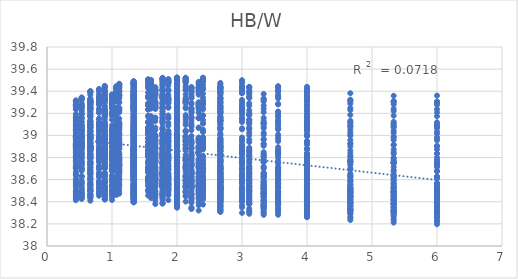
| Category | out:UTCI |
|---|---|
| 1.3333333333333333 | 38.668 |
| 0.8888888888888888 | 38.741 |
| 0.6666666666666666 | 38.758 |
| 0.5333333333333333 | 38.744 |
| 0.4444444444444444 | 38.714 |
| 1.3333333333333333 | 38.517 |
| 0.8888888888888888 | 38.595 |
| 0.6666666666666666 | 38.642 |
| 0.5333333333333333 | 38.679 |
| 0.4444444444444444 | 38.672 |
| 1.3333333333333333 | 38.457 |
| 0.8888888888888888 | 38.521 |
| 0.6666666666666666 | 38.559 |
| 0.5333333333333333 | 38.588 |
| 0.4444444444444444 | 38.606 |
| 1.3333333333333333 | 38.426 |
| 0.8888888888888888 | 38.489 |
| 0.6666666666666666 | 38.495 |
| 0.5333333333333333 | 38.526 |
| 0.4444444444444444 | 38.543 |
| 1.3333333333333333 | 38.423 |
| 0.8888888888888888 | 38.454 |
| 0.6666666666666666 | 38.47 |
| 0.5333333333333333 | 38.474 |
| 0.4444444444444444 | 38.492 |
| 1.3333333333333333 | 38.417 |
| 0.8888888888888888 | 38.42 |
| 0.6666666666666666 | 38.46 |
| 0.5333333333333333 | 38.458 |
| 0.4444444444444444 | 38.452 |
| 1.3333333333333333 | 38.414 |
| 0.8888888888888888 | 38.429 |
| 0.6666666666666666 | 38.432 |
| 0.5333333333333333 | 38.448 |
| 0.4444444444444444 | 38.426 |
| 1.3333333333333333 | 38.403 |
| 0.8888888888888888 | 38.423 |
| 0.6666666666666666 | 38.41 |
| 0.5333333333333333 | 38.426 |
| 0.4444444444444444 | 38.414 |
| 2.0 | 38.693 |
| 1.3333333333333333 | 38.779 |
| 1.0 | 38.826 |
| 0.8 | 38.826 |
| 0.6666666666666666 | 38.8 |
| 2.0 | 38.522 |
| 1.3333333333333333 | 38.629 |
| 1.0 | 38.708 |
| 0.8 | 38.76 |
| 0.6666666666666666 | 38.75 |
| 2.0 | 38.432 |
| 1.3333333333333333 | 38.535 |
| 1.0 | 38.614 |
| 0.8 | 38.657 |
| 0.6666666666666666 | 38.685 |
| 2.0 | 38.386 |
| 1.3333333333333333 | 38.482 |
| 1.0 | 38.531 |
| 0.8 | 38.588 |
| 0.6666666666666666 | 38.615 |
| 2.0 | 38.378 |
| 1.3333333333333333 | 38.439 |
| 1.0 | 38.492 |
| 0.8 | 38.522 |
| 0.6666666666666666 | 38.553 |
| 2.0 | 38.37 |
| 1.3333333333333333 | 38.397 |
| 1.0 | 38.476 |
| 0.8 | 38.494 |
| 0.6666666666666666 | 38.504 |
| 2.0 | 38.364 |
| 1.3333333333333333 | 38.402 |
| 1.0 | 38.442 |
| 0.8 | 38.48 |
| 0.6666666666666666 | 38.47 |
| 2.0 | 38.352 |
| 1.3333333333333333 | 38.397 |
| 1.0 | 38.416 |
| 0.8 | 38.455 |
| 0.6666666666666666 | 38.456 |
| 2.6666666666666665 | 38.703 |
| 1.7777777777777777 | 38.82 |
| 1.3333333333333333 | 38.854 |
| 1.0666666666666667 | 38.875 |
| 0.8888888888888888 | 38.856 |
| 2.6666666666666665 | 38.522 |
| 1.7777777777777777 | 38.662 |
| 1.3333333333333333 | 38.729 |
| 1.0666666666666667 | 38.799 |
| 0.8888888888888888 | 38.802 |
| 2.6666666666666665 | 38.418 |
| 1.7777777777777777 | 38.557 |
| 1.3333333333333333 | 38.63 |
| 1.0666666666666667 | 38.697 |
| 0.8888888888888888 | 38.734 |
| 2.6666666666666665 | 38.355 |
| 1.7777777777777777 | 38.493 |
| 1.3333333333333333 | 38.54 |
| 1.0666666666666667 | 38.623 |
| 0.8888888888888888 | 38.661 |
| 2.6666666666666665 | 38.34 |
| 1.7777777777777777 | 38.436 |
| 1.3333333333333333 | 38.489 |
| 1.0666666666666667 | 38.549 |
| 0.8888888888888888 | 38.593 |
| 2.6666666666666665 | 38.33 |
| 1.7777777777777777 | 38.388 |
| 1.3333333333333333 | 38.463 |
| 1.0666666666666667 | 38.512 |
| 0.8888888888888888 | 38.534 |
| 2.6666666666666665 | 38.324 |
| 1.7777777777777777 | 38.389 |
| 1.3333333333333333 | 38.424 |
| 1.0666666666666667 | 38.49 |
| 0.8888888888888888 | 38.494 |
| 2.6666666666666665 | 38.31 |
| 1.7777777777777777 | 38.383 |
| 1.3333333333333333 | 38.394 |
| 1.0666666666666667 | 38.462 |
| 0.8888888888888888 | 38.472 |
| 3.3333333333333335 | 38.712 |
| 2.2222222222222223 | 38.824 |
| 1.6666666666666667 | 38.878 |
| 1.3333333333333333 | 38.886 |
| 1.1111111111111112 | 38.88 |
| 3.3333333333333335 | 38.524 |
| 2.2222222222222223 | 38.658 |
| 1.6666666666666667 | 38.749 |
| 1.3333333333333333 | 38.808 |
| 1.1111111111111112 | 38.826 |
| 3.3333333333333335 | 38.414 |
| 2.2222222222222223 | 38.547 |
| 1.6666666666666667 | 38.644 |
| 1.3333333333333333 | 38.704 |
| 1.1111111111111112 | 38.756 |
| 3.3333333333333335 | 38.343 |
| 2.2222222222222223 | 38.474 |
| 1.6666666666666667 | 38.547 |
| 1.3333333333333333 | 38.622 |
| 1.1111111111111112 | 38.68 |
| 3.3333333333333335 | 38.319 |
| 2.2222222222222223 | 38.407 |
| 1.6666666666666667 | 38.491 |
| 1.3333333333333333 | 38.544 |
| 1.1111111111111112 | 38.609 |
| 3.3333333333333335 | 38.305 |
| 2.2222222222222223 | 38.348 |
| 1.6666666666666667 | 38.458 |
| 1.3333333333333333 | 38.501 |
| 1.1111111111111112 | 38.547 |
| 3.3333333333333335 | 38.297 |
| 2.2222222222222223 | 38.344 |
| 1.6666666666666667 | 38.413 |
| 1.3333333333333333 | 38.473 |
| 1.1111111111111112 | 38.499 |
| 3.3333333333333335 | 38.282 |
| 2.2222222222222223 | 38.334 |
| 1.6666666666666667 | 38.38 |
| 1.3333333333333333 | 38.439 |
| 1.1111111111111112 | 38.473 |
| 4.0 | 38.71 |
| 2.6666666666666665 | 38.832 |
| 2.0 | 38.879 |
| 1.6 | 38.908 |
| 1.3333333333333333 | 38.891 |
| 4.0 | 38.52 |
| 2.6666666666666665 | 38.661 |
| 2.0 | 38.745 |
| 1.6 | 38.826 |
| 1.3333333333333333 | 38.833 |
| 4.0 | 38.406 |
| 2.6666666666666665 | 38.545 |
| 2.0 | 38.636 |
| 1.6 | 38.719 |
| 1.3333333333333333 | 38.76 |
| 4.0 | 38.332 |
| 2.6666666666666665 | 38.468 |
| 2.0 | 38.534 |
| 1.6 | 38.634 |
| 1.3333333333333333 | 38.681 |
| 4.0 | 38.305 |
| 2.6666666666666665 | 38.398 |
| 2.0 | 38.477 |
| 1.6 | 38.554 |
| 1.3333333333333333 | 38.609 |
| 4.0 | 38.285 |
| 2.6666666666666665 | 38.335 |
| 2.0 | 38.439 |
| 1.6 | 38.509 |
| 1.3333333333333333 | 38.543 |
| 4.0 | 38.275 |
| 2.6666666666666665 | 38.327 |
| 2.0 | 38.388 |
| 1.6 | 38.475 |
| 1.3333333333333333 | 38.493 |
| 4.0 | 38.26 |
| 2.6666666666666665 | 38.313 |
| 2.0 | 38.346 |
| 1.6 | 38.434 |
| 1.3333333333333333 | 38.462 |
| 4.666666666666667 | 38.703 |
| 3.111111111111111 | 38.833 |
| 2.3333333333333335 | 38.884 |
| 1.8666666666666667 | 38.91 |
| 1.5555555555555556 | 38.909 |
| 4.666666666666667 | 38.51 |
| 3.111111111111111 | 38.661 |
| 2.3333333333333335 | 38.746 |
| 1.8666666666666667 | 38.824 |
| 1.5555555555555556 | 38.847 |
| 4.666666666666667 | 38.396 |
| 3.111111111111111 | 38.542 |
| 2.3333333333333335 | 38.633 |
| 1.8666666666666667 | 38.716 |
| 1.5555555555555556 | 38.771 |
| 4.666666666666667 | 38.319 |
| 3.111111111111111 | 38.461 |
| 2.3333333333333335 | 38.527 |
| 1.8666666666666667 | 38.627 |
| 1.5555555555555556 | 38.69 |
| 4.666666666666667 | 38.291 |
| 3.111111111111111 | 38.389 |
| 2.3333333333333335 | 38.467 |
| 1.8666666666666667 | 38.544 |
| 1.5555555555555556 | 38.616 |
| 4.666666666666667 | 38.265 |
| 3.111111111111111 | 38.321 |
| 2.3333333333333335 | 38.423 |
| 1.8666666666666667 | 38.494 |
| 1.5555555555555556 | 38.545 |
| 4.666666666666667 | 38.252 |
| 3.111111111111111 | 38.309 |
| 2.3333333333333335 | 38.368 |
| 1.8666666666666667 | 38.459 |
| 1.5555555555555556 | 38.493 |
| 4.666666666666667 | 38.235 |
| 3.111111111111111 | 38.291 |
| 2.3333333333333335 | 38.321 |
| 1.8666666666666667 | 38.415 |
| 1.5555555555555556 | 38.457 |
| 5.333333333333333 | 38.688 |
| 3.5555555555555554 | 38.836 |
| 2.6666666666666665 | 38.885 |
| 2.1333333333333333 | 38.915 |
| 1.7777777777777777 | 38.902 |
| 5.333333333333333 | 38.494 |
| 3.5555555555555554 | 38.663 |
| 2.6666666666666665 | 38.747 |
| 2.1333333333333333 | 38.825 |
| 1.7777777777777777 | 38.839 |
| 5.333333333333333 | 38.379 |
| 3.5555555555555554 | 38.543 |
| 2.6666666666666665 | 38.631 |
| 2.1333333333333333 | 38.714 |
| 1.7777777777777777 | 38.76 |
| 5.333333333333333 | 38.301 |
| 3.5555555555555554 | 38.46 |
| 2.6666666666666665 | 38.522 |
| 2.1333333333333333 | 38.623 |
| 1.7777777777777777 | 38.676 |
| 5.333333333333333 | 38.273 |
| 3.5555555555555554 | 38.386 |
| 2.6666666666666665 | 38.461 |
| 2.1333333333333333 | 38.537 |
| 1.7777777777777777 | 38.601 |
| 5.333333333333333 | 38.247 |
| 3.5555555555555554 | 38.316 |
| 2.6666666666666665 | 38.415 |
| 2.1333333333333333 | 38.485 |
| 1.7777777777777777 | 38.528 |
| 5.333333333333333 | 38.232 |
| 3.5555555555555554 | 38.303 |
| 2.6666666666666665 | 38.358 |
| 2.1333333333333333 | 38.448 |
| 1.7777777777777777 | 38.475 |
| 5.333333333333333 | 38.212 |
| 3.5555555555555554 | 38.282 |
| 2.6666666666666665 | 38.309 |
| 2.1333333333333333 | 38.402 |
| 1.7777777777777777 | 38.438 |
| 6.0 | 38.678 |
| 4.0 | 38.832 |
| 3.0 | 38.888 |
| 2.4 | 38.904 |
| 2.0 | 38.906 |
| 6.0 | 38.483 |
| 4.0 | 38.657 |
| 3.0 | 38.748 |
| 2.4 | 38.812 |
| 2.0 | 38.839 |
| 6.0 | 38.368 |
| 4.0 | 38.535 |
| 3.0 | 38.632 |
| 2.4 | 38.699 |
| 2.0 | 38.759 |
| 6.0 | 38.288 |
| 4.0 | 38.452 |
| 3.0 | 38.521 |
| 2.4 | 38.606 |
| 2.0 | 38.672 |
| 6.0 | 38.26 |
| 4.0 | 38.375 |
| 3.0 | 38.456 |
| 2.4 | 38.518 |
| 2.0 | 38.596 |
| 6.0 | 38.234 |
| 4.0 | 38.302 |
| 3.0 | 38.407 |
| 2.4 | 38.46 |
| 2.0 | 38.518 |
| 6.0 | 38.218 |
| 4.0 | 38.288 |
| 3.0 | 38.349 |
| 2.4 | 38.422 |
| 2.0 | 38.464 |
| 6.0 | 38.197 |
| 4.0 | 38.267 |
| 3.0 | 38.3 |
| 2.4 | 38.375 |
| 2.0 | 38.426 |
| 1.3333333333333333 | 38.717 |
| 0.8888888888888888 | 38.761 |
| 0.6666666666666666 | 38.802 |
| 0.5333333333333333 | 38.76 |
| 0.4444444444444444 | 38.723 |
| 1.3333333333333333 | 38.567 |
| 0.8888888888888888 | 38.643 |
| 0.6666666666666666 | 38.711 |
| 0.5333333333333333 | 38.699 |
| 0.4444444444444444 | 38.701 |
| 1.3333333333333333 | 38.508 |
| 0.8888888888888888 | 38.539 |
| 0.6666666666666666 | 38.602 |
| 0.5333333333333333 | 38.629 |
| 0.4444444444444444 | 38.636 |
| 1.3333333333333333 | 38.472 |
| 0.8888888888888888 | 38.507 |
| 0.6666666666666666 | 38.535 |
| 0.5333333333333333 | 38.542 |
| 0.4444444444444444 | 38.569 |
| 1.3333333333333333 | 38.459 |
| 0.8888888888888888 | 38.454 |
| 0.6666666666666666 | 38.507 |
| 0.5333333333333333 | 38.491 |
| 0.4444444444444444 | 38.509 |
| 1.3333333333333333 | 38.466 |
| 0.8888888888888888 | 38.451 |
| 0.6666666666666666 | 38.5 |
| 0.5333333333333333 | 38.473 |
| 0.4444444444444444 | 38.465 |
| 1.3333333333333333 | 38.441 |
| 0.8888888888888888 | 38.454 |
| 0.6666666666666666 | 38.455 |
| 0.5333333333333333 | 38.449 |
| 0.4444444444444444 | 38.442 |
| 1.3333333333333333 | 38.436 |
| 0.8888888888888888 | 38.425 |
| 0.6666666666666666 | 38.438 |
| 0.5333333333333333 | 38.433 |
| 0.4444444444444444 | 38.428 |
| 2.0 | 38.762 |
| 1.3333333333333333 | 38.84 |
| 1.0 | 38.893 |
| 0.8 | 38.85 |
| 0.6666666666666666 | 38.832 |
| 2.0 | 38.593 |
| 1.3333333333333333 | 38.72 |
| 1.0 | 38.795 |
| 0.8 | 38.794 |
| 0.6666666666666666 | 38.81 |
| 2.0 | 38.508 |
| 1.3333333333333333 | 38.601 |
| 1.0 | 38.677 |
| 0.8 | 38.714 |
| 0.6666666666666666 | 38.737 |
| 2.0 | 38.453 |
| 1.3333333333333333 | 38.546 |
| 1.0 | 38.594 |
| 0.8 | 38.622 |
| 0.6666666666666666 | 38.669 |
| 2.0 | 38.435 |
| 1.3333333333333333 | 38.482 |
| 1.0 | 38.551 |
| 0.8 | 38.557 |
| 0.6666666666666666 | 38.6 |
| 2.0 | 38.441 |
| 1.3333333333333333 | 38.47 |
| 1.0 | 38.537 |
| 0.8 | 38.527 |
| 0.6666666666666666 | 38.546 |
| 2.0 | 38.41 |
| 1.3333333333333333 | 38.471 |
| 1.0 | 38.486 |
| 0.8 | 38.498 |
| 0.6666666666666666 | 38.513 |
| 2.0 | 38.402 |
| 1.3333333333333333 | 38.442 |
| 1.0 | 38.466 |
| 0.8 | 38.478 |
| 0.6666666666666666 | 38.496 |
| 2.6666666666666665 | 38.778 |
| 1.7777777777777777 | 38.869 |
| 1.3333333333333333 | 38.908 |
| 1.0666666666666667 | 38.92 |
| 0.8888888888888888 | 38.88 |
| 2.6666666666666665 | 38.597 |
| 1.7777777777777777 | 38.741 |
| 1.3333333333333333 | 38.808 |
| 1.0666666666666667 | 38.862 |
| 0.8888888888888888 | 38.849 |
| 2.6666666666666665 | 38.496 |
| 1.7777777777777777 | 38.61 |
| 1.3333333333333333 | 38.69 |
| 1.0666666666666667 | 38.768 |
| 0.8888888888888888 | 38.776 |
| 2.6666666666666665 | 38.426 |
| 1.7777777777777777 | 38.546 |
| 1.3333333333333333 | 38.6 |
| 1.0666666666666667 | 38.673 |
| 0.8888888888888888 | 38.704 |
| 2.6666666666666665 | 38.398 |
| 1.7777777777777777 | 38.47 |
| 1.3333333333333333 | 38.546 |
| 1.0666666666666667 | 38.602 |
| 0.8888888888888888 | 38.631 |
| 2.6666666666666665 | 38.4 |
| 1.7777777777777777 | 38.452 |
| 1.3333333333333333 | 38.522 |
| 1.0666666666666667 | 38.562 |
| 0.8888888888888888 | 38.57 |
| 2.6666666666666665 | 38.372 |
| 1.7777777777777777 | 38.448 |
| 1.3333333333333333 | 38.465 |
| 1.0666666666666667 | 38.525 |
| 0.8888888888888888 | 38.531 |
| 2.6666666666666665 | 38.362 |
| 1.7777777777777777 | 38.418 |
| 1.3333333333333333 | 38.441 |
| 1.0666666666666667 | 38.503 |
| 0.8888888888888888 | 38.508 |
| 3.3333333333333335 | 38.774 |
| 2.2222222222222223 | 38.881 |
| 1.6666666666666667 | 38.947 |
| 1.3333333333333333 | 38.917 |
| 1.1111111111111112 | 38.921 |
| 3.3333333333333335 | 38.585 |
| 2.2222222222222223 | 38.745 |
| 1.6666666666666667 | 38.841 |
| 1.3333333333333333 | 38.854 |
| 1.1111111111111112 | 38.891 |
| 3.3333333333333335 | 38.477 |
| 2.2222222222222223 | 38.608 |
| 1.6666666666666667 | 38.717 |
| 1.3333333333333333 | 38.763 |
| 1.1111111111111112 | 38.815 |
| 3.3333333333333335 | 38.412 |
| 2.2222222222222223 | 38.543 |
| 1.6666666666666667 | 38.62 |
| 1.3333333333333333 | 38.667 |
| 1.1111111111111112 | 38.741 |
| 3.3333333333333335 | 38.375 |
| 2.2222222222222223 | 38.46 |
| 1.6666666666666667 | 38.563 |
| 1.3333333333333333 | 38.592 |
| 1.1111111111111112 | 38.666 |
| 3.3333333333333335 | 38.373 |
| 2.2222222222222223 | 38.433 |
| 1.6666666666666667 | 38.532 |
| 1.3333333333333333 | 38.548 |
| 1.1111111111111112 | 38.602 |
| 3.3333333333333335 | 38.348 |
| 2.2222222222222223 | 38.425 |
| 1.6666666666666667 | 38.469 |
| 1.3333333333333333 | 38.504 |
| 1.1111111111111112 | 38.556 |
| 3.3333333333333335 | 38.335 |
| 2.2222222222222223 | 38.391 |
| 1.6666666666666667 | 38.44 |
| 1.3333333333333333 | 38.478 |
| 1.1111111111111112 | 38.529 |
| 4.0 | 38.764 |
| 2.6666666666666665 | 38.86 |
| 2.0 | 38.954 |
| 1.6 | 38.945 |
| 1.3333333333333333 | 38.925 |
| 4.0 | 38.572 |
| 2.6666666666666665 | 38.722 |
| 2.0 | 38.844 |
| 1.6 | 38.878 |
| 1.3333333333333333 | 38.892 |
| 4.0 | 38.461 |
| 2.6666666666666665 | 38.579 |
| 2.0 | 38.716 |
| 1.6 | 38.783 |
| 1.3333333333333333 | 38.812 |
| 4.0 | 38.393 |
| 2.6666666666666665 | 38.509 |
| 2.0 | 38.615 |
| 1.6 | 38.684 |
| 1.3333333333333333 | 38.737 |
| 4.0 | 38.358 |
| 2.6666666666666665 | 38.433 |
| 2.0 | 38.555 |
| 1.6 | 38.607 |
| 1.3333333333333333 | 38.661 |
| 4.0 | 38.349 |
| 2.6666666666666665 | 38.4 |
| 2.0 | 38.519 |
| 1.6 | 38.561 |
| 1.3333333333333333 | 38.595 |
| 4.0 | 38.324 |
| 2.6666666666666665 | 38.389 |
| 2.0 | 38.453 |
| 1.6 | 38.514 |
| 1.3333333333333333 | 38.546 |
| 4.0 | 38.31 |
| 2.6666666666666665 | 38.352 |
| 2.0 | 38.416 |
| 1.6 | 38.48 |
| 1.3333333333333333 | 38.515 |
| 4.666666666666667 | 38.776 |
| 3.111111111111111 | 38.889 |
| 2.3333333333333335 | 38.964 |
| 1.8666666666666667 | 38.959 |
| 1.5555555555555556 | 38.943 |
| 4.666666666666667 | 38.584 |
| 3.111111111111111 | 38.746 |
| 2.3333333333333335 | 38.852 |
| 1.8666666666666667 | 38.889 |
| 1.5555555555555556 | 38.906 |
| 4.666666666666667 | 38.47 |
| 3.111111111111111 | 38.601 |
| 2.3333333333333335 | 38.719 |
| 1.8666666666666667 | 38.792 |
| 1.5555555555555556 | 38.823 |
| 4.666666666666667 | 38.4 |
| 3.111111111111111 | 38.526 |
| 2.3333333333333335 | 38.614 |
| 1.8666666666666667 | 38.69 |
| 1.5555555555555556 | 38.746 |
| 4.666666666666667 | 38.362 |
| 3.111111111111111 | 38.445 |
| 2.3333333333333335 | 38.552 |
| 1.8666666666666667 | 38.61 |
| 1.5555555555555556 | 38.668 |
| 4.666666666666667 | 38.339 |
| 3.111111111111111 | 38.392 |
| 2.3333333333333335 | 38.506 |
| 1.8666666666666667 | 38.559 |
| 1.5555555555555556 | 38.593 |
| 4.666666666666667 | 38.31 |
| 3.111111111111111 | 38.378 |
| 2.3333333333333335 | 38.435 |
| 1.8666666666666667 | 38.51 |
| 1.5555555555555556 | 38.543 |
| 4.666666666666667 | 38.294 |
| 3.111111111111111 | 38.339 |
| 2.3333333333333335 | 38.394 |
| 1.8666666666666667 | 38.473 |
| 1.5555555555555556 | 38.507 |
| 5.333333333333333 | 38.763 |
| 3.5555555555555554 | 38.894 |
| 2.6666666666666665 | 38.944 |
| 2.1333333333333333 | 38.952 |
| 1.7777777777777777 | 38.955 |
| 5.333333333333333 | 38.566 |
| 3.5555555555555554 | 38.75 |
| 2.6666666666666665 | 38.829 |
| 2.1333333333333333 | 38.879 |
| 1.7777777777777777 | 38.918 |
| 5.333333333333333 | 38.451 |
| 3.5555555555555554 | 38.603 |
| 2.6666666666666665 | 38.695 |
| 2.1333333333333333 | 38.778 |
| 1.7777777777777777 | 38.832 |
| 5.333333333333333 | 38.379 |
| 3.5555555555555554 | 38.526 |
| 2.6666666666666665 | 38.588 |
| 2.1333333333333333 | 38.674 |
| 1.7777777777777777 | 38.752 |
| 5.333333333333333 | 38.339 |
| 3.5555555555555554 | 38.442 |
| 2.6666666666666665 | 38.525 |
| 2.1333333333333333 | 38.591 |
| 1.7777777777777777 | 38.672 |
| 5.333333333333333 | 38.314 |
| 3.5555555555555554 | 38.388 |
| 2.6666666666666665 | 38.476 |
| 2.1333333333333333 | 38.538 |
| 1.7777777777777777 | 38.596 |
| 5.333333333333333 | 38.292 |
| 3.5555555555555554 | 38.373 |
| 2.6666666666666665 | 38.415 |
| 2.1333333333333333 | 38.491 |
| 1.7777777777777777 | 38.548 |
| 5.333333333333333 | 38.274 |
| 3.5555555555555554 | 38.334 |
| 2.6666666666666665 | 38.371 |
| 2.1333333333333333 | 38.454 |
| 1.7777777777777777 | 38.51 |
| 6.0 | 38.741 |
| 4.0 | 38.87 |
| 3.0 | 38.954 |
| 2.4 | 38.95 |
| 2.0 | 38.959 |
| 6.0 | 38.541 |
| 4.0 | 38.726 |
| 3.0 | 38.839 |
| 2.4 | 38.874 |
| 2.0 | 38.92 |
| 6.0 | 38.429 |
| 4.0 | 38.579 |
| 3.0 | 38.703 |
| 2.4 | 38.773 |
| 2.0 | 38.834 |
| 6.0 | 38.358 |
| 4.0 | 38.501 |
| 3.0 | 38.595 |
| 2.4 | 38.667 |
| 2.0 | 38.751 |
| 6.0 | 38.318 |
| 4.0 | 38.415 |
| 3.0 | 38.528 |
| 2.4 | 38.583 |
| 2.0 | 38.669 |
| 6.0 | 38.293 |
| 4.0 | 38.359 |
| 3.0 | 38.477 |
| 2.4 | 38.525 |
| 2.0 | 38.588 |
| 6.0 | 38.269 |
| 4.0 | 38.344 |
| 3.0 | 38.413 |
| 2.4 | 38.476 |
| 2.0 | 38.539 |
| 6.0 | 38.259 |
| 4.0 | 38.316 |
| 3.0 | 38.368 |
| 2.4 | 38.435 |
| 2.0 | 38.496 |
| 1.3333333333333333 | 38.79 |
| 0.8888888888888888 | 38.817 |
| 0.6666666666666666 | 38.802 |
| 0.5333333333333333 | 38.809 |
| 0.4444444444444444 | 38.819 |
| 1.3333333333333333 | 38.619 |
| 0.8888888888888888 | 38.723 |
| 0.6666666666666666 | 38.74 |
| 0.5333333333333333 | 38.769 |
| 0.4444444444444444 | 38.764 |
| 1.3333333333333333 | 38.538 |
| 0.8888888888888888 | 38.586 |
| 0.6666666666666666 | 38.651 |
| 0.5333333333333333 | 38.706 |
| 0.4444444444444444 | 38.716 |
| 1.3333333333333333 | 38.503 |
| 0.8888888888888888 | 38.541 |
| 0.6666666666666666 | 38.563 |
| 0.5333333333333333 | 38.624 |
| 0.4444444444444444 | 38.652 |
| 1.3333333333333333 | 38.477 |
| 0.8888888888888888 | 38.501 |
| 0.6666666666666666 | 38.516 |
| 0.5333333333333333 | 38.562 |
| 0.4444444444444444 | 38.586 |
| 1.3333333333333333 | 38.472 |
| 0.8888888888888888 | 38.47 |
| 0.6666666666666666 | 38.49 |
| 0.5333333333333333 | 38.512 |
| 0.4444444444444444 | 38.535 |
| 1.3333333333333333 | 38.455 |
| 0.8888888888888888 | 38.465 |
| 0.6666666666666666 | 38.457 |
| 0.5333333333333333 | 38.503 |
| 0.4444444444444444 | 38.493 |
| 1.3333333333333333 | 38.445 |
| 0.8888888888888888 | 38.453 |
| 0.6666666666666666 | 38.441 |
| 0.5333333333333333 | 38.476 |
| 0.4444444444444444 | 38.472 |
| 2.0 | 38.822 |
| 1.3333333333333333 | 38.918 |
| 1.0 | 38.896 |
| 0.8 | 38.908 |
| 0.6666666666666666 | 38.923 |
| 2.0 | 38.633 |
| 1.3333333333333333 | 38.801 |
| 1.0 | 38.832 |
| 0.8 | 38.855 |
| 0.6666666666666666 | 38.874 |
| 2.0 | 38.533 |
| 1.3333333333333333 | 38.666 |
| 1.0 | 38.731 |
| 0.8 | 38.786 |
| 0.6666666666666666 | 38.823 |
| 2.0 | 38.48 |
| 1.3333333333333333 | 38.605 |
| 1.0 | 38.638 |
| 0.8 | 38.704 |
| 0.6666666666666666 | 38.756 |
| 2.0 | 38.446 |
| 1.3333333333333333 | 38.551 |
| 1.0 | 38.578 |
| 0.8 | 38.632 |
| 0.6666666666666666 | 38.681 |
| 2.0 | 38.44 |
| 1.3333333333333333 | 38.514 |
| 1.0 | 38.543 |
| 0.8 | 38.574 |
| 0.6666666666666666 | 38.625 |
| 2.0 | 38.42 |
| 1.3333333333333333 | 38.507 |
| 1.0 | 38.507 |
| 0.8 | 38.557 |
| 0.6666666666666666 | 38.577 |
| 2.0 | 38.411 |
| 1.3333333333333333 | 38.493 |
| 1.0 | 38.486 |
| 0.8 | 38.527 |
| 0.6666666666666666 | 38.549 |
| 2.6666666666666665 | 38.832 |
| 1.7777777777777777 | 38.925 |
| 1.3333333333333333 | 38.944 |
| 1.0666666666666667 | 38.969 |
| 0.8888888888888888 | 38.98 |
| 2.6666666666666665 | 38.632 |
| 1.7777777777777777 | 38.813 |
| 1.3333333333333333 | 38.868 |
| 1.0666666666666667 | 38.91 |
| 0.8888888888888888 | 38.928 |
| 2.6666666666666665 | 38.52 |
| 1.7777777777777777 | 38.667 |
| 1.3333333333333333 | 38.765 |
| 1.0666666666666667 | 38.841 |
| 0.8888888888888888 | 38.865 |
| 2.6666666666666665 | 38.457 |
| 1.7777777777777777 | 38.599 |
| 1.3333333333333333 | 38.667 |
| 1.0666666666666667 | 38.756 |
| 0.8888888888888888 | 38.796 |
| 2.6666666666666665 | 38.418 |
| 1.7777777777777777 | 38.535 |
| 1.3333333333333333 | 38.6 |
| 1.0666666666666667 | 38.68 |
| 0.8888888888888888 | 38.722 |
| 2.6666666666666665 | 38.405 |
| 1.7777777777777777 | 38.488 |
| 1.3333333333333333 | 38.555 |
| 1.0666666666666667 | 38.614 |
| 0.8888888888888888 | 38.662 |
| 2.6666666666666665 | 38.384 |
| 1.7777777777777777 | 38.477 |
| 1.3333333333333333 | 38.514 |
| 1.0666666666666667 | 38.591 |
| 0.8888888888888888 | 38.607 |
| 2.6666666666666665 | 38.374 |
| 1.7777777777777777 | 38.461 |
| 1.3333333333333333 | 38.489 |
| 1.0666666666666667 | 38.555 |
| 0.8888888888888888 | 38.574 |
| 3.3333333333333335 | 38.833 |
| 2.2222222222222223 | 38.943 |
| 1.6666666666666667 | 38.957 |
| 1.3333333333333333 | 38.99 |
| 1.1111111111111112 | 39.021 |
| 3.3333333333333335 | 38.626 |
| 2.2222222222222223 | 38.826 |
| 1.6666666666666667 | 38.88 |
| 1.3333333333333333 | 38.932 |
| 1.1111111111111112 | 38.966 |
| 3.3333333333333335 | 38.509 |
| 2.2222222222222223 | 38.674 |
| 1.6666666666666667 | 38.772 |
| 1.3333333333333333 | 38.86 |
| 1.1111111111111112 | 38.9 |
| 3.3333333333333335 | 38.443 |
| 2.2222222222222223 | 38.593 |
| 1.6666666666666667 | 38.666 |
| 1.3333333333333333 | 38.77 |
| 1.1111111111111112 | 38.829 |
| 3.3333333333333335 | 38.399 |
| 2.2222222222222223 | 38.525 |
| 1.6666666666666667 | 38.596 |
| 1.3333333333333333 | 38.692 |
| 1.1111111111111112 | 38.753 |
| 3.3333333333333335 | 38.381 |
| 2.2222222222222223 | 38.471 |
| 1.6666666666666667 | 38.546 |
| 1.3333333333333333 | 38.623 |
| 1.1111111111111112 | 38.691 |
| 3.3333333333333335 | 38.359 |
| 2.2222222222222223 | 38.455 |
| 1.6666666666666667 | 38.5 |
| 1.3333333333333333 | 38.595 |
| 1.1111111111111112 | 38.634 |
| 3.3333333333333335 | 38.347 |
| 2.2222222222222223 | 38.435 |
| 1.6666666666666667 | 38.466 |
| 1.3333333333333333 | 38.552 |
| 1.1111111111111112 | 38.596 |
| 4.0 | 38.83 |
| 2.6666666666666665 | 38.943 |
| 2.0 | 38.97 |
| 1.6 | 39 |
| 1.3333333333333333 | 39.032 |
| 4.0 | 38.622 |
| 2.6666666666666665 | 38.822 |
| 2.0 | 38.889 |
| 1.6 | 38.938 |
| 1.3333333333333333 | 38.971 |
| 4.0 | 38.5 |
| 2.6666666666666665 | 38.666 |
| 2.0 | 38.777 |
| 1.6 | 38.864 |
| 1.3333333333333333 | 38.907 |
| 4.0 | 38.43 |
| 2.6666666666666665 | 38.581 |
| 2.0 | 38.668 |
| 1.6 | 38.771 |
| 1.3333333333333333 | 38.834 |
| 4.0 | 38.386 |
| 2.6666666666666665 | 38.507 |
| 2.0 | 38.596 |
| 1.6 | 38.69 |
| 1.3333333333333333 | 38.761 |
| 4.0 | 38.364 |
| 2.6666666666666665 | 38.45 |
| 2.0 | 38.544 |
| 1.6 | 38.619 |
| 1.3333333333333333 | 38.696 |
| 4.0 | 38.343 |
| 2.6666666666666665 | 38.43 |
| 2.0 | 38.496 |
| 1.6 | 38.588 |
| 1.3333333333333333 | 38.637 |
| 4.0 | 38.329 |
| 2.6666666666666665 | 38.406 |
| 2.0 | 38.457 |
| 1.6 | 38.541 |
| 1.3333333333333333 | 38.595 |
| 4.666666666666667 | 38.839 |
| 3.111111111111111 | 38.94 |
| 2.3333333333333335 | 38.98 |
| 1.8666666666666667 | 39.012 |
| 1.5555555555555556 | 39.033 |
| 4.666666666666667 | 38.628 |
| 3.111111111111111 | 38.815 |
| 2.3333333333333335 | 38.899 |
| 1.8666666666666667 | 38.947 |
| 1.5555555555555556 | 38.974 |
| 4.666666666666667 | 38.505 |
| 3.111111111111111 | 38.654 |
| 2.3333333333333335 | 38.782 |
| 1.8666666666666667 | 38.869 |
| 1.5555555555555556 | 38.907 |
| 4.666666666666667 | 38.435 |
| 3.111111111111111 | 38.566 |
| 2.3333333333333335 | 38.668 |
| 1.8666666666666667 | 38.774 |
| 1.5555555555555556 | 38.832 |
| 4.666666666666667 | 38.389 |
| 3.111111111111111 | 38.49 |
| 2.3333333333333335 | 38.594 |
| 1.8666666666666667 | 38.691 |
| 1.5555555555555556 | 38.757 |
| 4.666666666666667 | 38.361 |
| 3.111111111111111 | 38.434 |
| 2.3333333333333335 | 38.543 |
| 1.8666666666666667 | 38.615 |
| 1.5555555555555556 | 38.687 |
| 4.666666666666667 | 38.336 |
| 3.111111111111111 | 38.413 |
| 2.3333333333333335 | 38.494 |
| 1.8666666666666667 | 38.582 |
| 1.5555555555555556 | 38.626 |
| 4.666666666666667 | 38.322 |
| 3.111111111111111 | 38.386 |
| 2.3333333333333335 | 38.452 |
| 1.8666666666666667 | 38.533 |
| 1.5555555555555556 | 38.583 |
| 5.333333333333333 | 38.833 |
| 3.5555555555555554 | 38.948 |
| 2.6666666666666665 | 38.979 |
| 2.1333333333333333 | 39.032 |
| 1.7777777777777777 | 39.057 |
| 5.333333333333333 | 38.621 |
| 3.5555555555555554 | 38.822 |
| 2.6666666666666665 | 38.895 |
| 2.1333333333333333 | 38.966 |
| 1.7777777777777777 | 38.994 |
| 5.333333333333333 | 38.496 |
| 3.5555555555555554 | 38.66 |
| 2.6666666666666665 | 38.777 |
| 2.1333333333333333 | 38.884 |
| 1.7777777777777777 | 38.926 |
| 5.333333333333333 | 38.425 |
| 3.5555555555555554 | 38.57 |
| 2.6666666666666665 | 38.662 |
| 2.1333333333333333 | 38.787 |
| 1.7777777777777777 | 38.849 |
| 5.333333333333333 | 38.379 |
| 3.5555555555555554 | 38.492 |
| 2.6666666666666665 | 38.586 |
| 2.1333333333333333 | 38.701 |
| 1.7777777777777777 | 38.771 |
| 5.333333333333333 | 38.351 |
| 3.5555555555555554 | 38.434 |
| 2.6666666666666665 | 38.532 |
| 2.1333333333333333 | 38.623 |
| 1.7777777777777777 | 38.7 |
| 5.333333333333333 | 38.326 |
| 3.5555555555555554 | 38.412 |
| 2.6666666666666665 | 38.482 |
| 2.1333333333333333 | 38.589 |
| 1.7777777777777777 | 38.635 |
| 5.333333333333333 | 38.311 |
| 3.5555555555555554 | 38.384 |
| 2.6666666666666665 | 38.439 |
| 2.1333333333333333 | 38.54 |
| 1.7777777777777777 | 38.59 |
| 6.0 | 38.837 |
| 4.0 | 38.948 |
| 3.0 | 38.981 |
| 2.4 | 39.031 |
| 2.0 | 39.053 |
| 6.0 | 38.628 |
| 4.0 | 38.822 |
| 3.0 | 38.897 |
| 2.4 | 38.963 |
| 2.0 | 38.99 |
| 6.0 | 38.499 |
| 4.0 | 38.659 |
| 3.0 | 38.776 |
| 2.4 | 38.88 |
| 2.0 | 38.92 |
| 6.0 | 38.426 |
| 4.0 | 38.566 |
| 3.0 | 38.658 |
| 2.4 | 38.781 |
| 2.0 | 38.843 |
| 6.0 | 38.38 |
| 4.0 | 38.486 |
| 3.0 | 38.578 |
| 2.4 | 38.69 |
| 2.0 | 38.76 |
| 6.0 | 38.351 |
| 4.0 | 38.427 |
| 3.0 | 38.523 |
| 2.4 | 38.61 |
| 2.0 | 38.688 |
| 6.0 | 38.325 |
| 4.0 | 38.404 |
| 3.0 | 38.471 |
| 2.4 | 38.576 |
| 2.0 | 38.622 |
| 6.0 | 38.305 |
| 4.0 | 38.369 |
| 3.0 | 38.417 |
| 2.4 | 38.526 |
| 2.0 | 38.58 |
| 1.3333333333333333 | 38.891 |
| 0.8888888888888888 | 38.894 |
| 0.6666666666666666 | 38.962 |
| 0.5333333333333333 | 38.928 |
| 0.4444444444444444 | 38.893 |
| 1.3333333333333333 | 38.713 |
| 0.8888888888888888 | 38.833 |
| 0.6666666666666666 | 38.901 |
| 0.5333333333333333 | 38.871 |
| 0.4444444444444444 | 38.873 |
| 1.3333333333333333 | 38.625 |
| 0.8888888888888888 | 38.708 |
| 0.6666666666666666 | 38.813 |
| 0.5333333333333333 | 38.824 |
| 0.4444444444444444 | 38.81 |
| 1.3333333333333333 | 38.565 |
| 0.8888888888888888 | 38.628 |
| 0.6666666666666666 | 38.734 |
| 0.5333333333333333 | 38.752 |
| 0.4444444444444444 | 38.771 |
| 1.3333333333333333 | 38.521 |
| 0.8888888888888888 | 38.578 |
| 0.6666666666666666 | 38.653 |
| 0.5333333333333333 | 38.689 |
| 0.4444444444444444 | 38.724 |
| 1.3333333333333333 | 38.518 |
| 0.8888888888888888 | 38.534 |
| 0.6666666666666666 | 38.615 |
| 0.5333333333333333 | 38.633 |
| 0.4444444444444444 | 38.649 |
| 1.3333333333333333 | 38.51 |
| 0.8888888888888888 | 38.523 |
| 0.6666666666666666 | 38.578 |
| 0.5333333333333333 | 38.575 |
| 0.4444444444444444 | 38.601 |
| 1.3333333333333333 | 38.479 |
| 0.8888888888888888 | 38.5 |
| 0.6666666666666666 | 38.528 |
| 0.5333333333333333 | 38.567 |
| 0.4444444444444444 | 38.561 |
| 2.0 | 38.921 |
| 1.3333333333333333 | 39.003 |
| 1.0 | 39.055 |
| 0.8 | 39.036 |
| 0.6666666666666666 | 39.028 |
| 2.0 | 38.734 |
| 1.3333333333333333 | 38.923 |
| 1.0 | 38.988 |
| 0.8 | 38.979 |
| 0.6666666666666666 | 38.99 |
| 2.0 | 38.634 |
| 1.3333333333333333 | 38.791 |
| 1.0 | 38.892 |
| 0.8 | 38.931 |
| 0.6666666666666666 | 38.925 |
| 2.0 | 38.556 |
| 1.3333333333333333 | 38.706 |
| 1.0 | 38.81 |
| 0.8 | 38.856 |
| 0.6666666666666666 | 38.884 |
| 2.0 | 38.507 |
| 1.3333333333333333 | 38.644 |
| 1.0 | 38.725 |
| 0.8 | 38.788 |
| 0.6666666666666666 | 38.832 |
| 2.0 | 38.5 |
| 1.3333333333333333 | 38.593 |
| 1.0 | 38.68 |
| 0.8 | 38.726 |
| 0.6666666666666666 | 38.757 |
| 2.0 | 38.487 |
| 1.3333333333333333 | 38.577 |
| 1.0 | 38.635 |
| 0.8 | 38.662 |
| 0.6666666666666666 | 38.704 |
| 2.0 | 38.453 |
| 1.3333333333333333 | 38.553 |
| 1.0 | 38.584 |
| 0.8 | 38.647 |
| 0.6666666666666666 | 38.659 |
| 2.6666666666666665 | 38.963 |
| 1.7777777777777777 | 39.019 |
| 1.3333333333333333 | 39.096 |
| 1.0666666666666667 | 39.098 |
| 0.8888888888888888 | 39.072 |
| 2.6666666666666665 | 38.767 |
| 1.7777777777777777 | 38.932 |
| 1.3333333333333333 | 39.019 |
| 1.0666666666666667 | 39.036 |
| 0.8888888888888888 | 39.031 |
| 2.6666666666666665 | 38.655 |
| 1.7777777777777777 | 38.798 |
| 1.3333333333333333 | 38.922 |
| 1.0666666666666667 | 38.989 |
| 0.8888888888888888 | 38.978 |
| 2.6666666666666665 | 38.563 |
| 1.7777777777777777 | 38.708 |
| 1.3333333333333333 | 38.836 |
| 1.0666666666666667 | 38.909 |
| 0.8888888888888888 | 38.934 |
| 2.6666666666666665 | 38.51 |
| 1.7777777777777777 | 38.641 |
| 1.3333333333333333 | 38.748 |
| 1.0666666666666667 | 38.836 |
| 0.8888888888888888 | 38.882 |
| 2.6666666666666665 | 38.499 |
| 1.7777777777777777 | 38.58 |
| 1.3333333333333333 | 38.699 |
| 1.0666666666666667 | 38.775 |
| 0.8888888888888888 | 38.807 |
| 2.6666666666666665 | 38.478 |
| 1.7777777777777777 | 38.561 |
| 1.3333333333333333 | 38.647 |
| 1.0666666666666667 | 38.708 |
| 0.8888888888888888 | 38.752 |
| 2.6666666666666665 | 38.447 |
| 1.7777777777777777 | 38.535 |
| 1.3333333333333333 | 38.593 |
| 1.0666666666666667 | 38.687 |
| 0.8888888888888888 | 38.702 |
| 3.3333333333333335 | 38.962 |
| 2.2222222222222223 | 39.047 |
| 1.6666666666666667 | 39.13 |
| 1.3333333333333333 | 39.127 |
| 1.1111111111111112 | 39.121 |
| 3.3333333333333335 | 38.76 |
| 2.2222222222222223 | 38.959 |
| 1.6666666666666667 | 39.049 |
| 1.3333333333333333 | 39.061 |
| 1.1111111111111112 | 39.077 |
| 3.3333333333333335 | 38.643 |
| 2.2222222222222223 | 38.821 |
| 1.6666666666666667 | 38.947 |
| 1.3333333333333333 | 39.011 |
| 1.1111111111111112 | 39.022 |
| 3.3333333333333335 | 38.542 |
| 2.2222222222222223 | 38.722 |
| 1.6666666666666667 | 38.857 |
| 1.3333333333333333 | 38.92 |
| 1.1111111111111112 | 38.976 |
| 3.3333333333333335 | 38.491 |
| 2.2222222222222223 | 38.653 |
| 1.6666666666666667 | 38.767 |
| 1.3333333333333333 | 38.848 |
| 1.1111111111111112 | 38.92 |
| 3.3333333333333335 | 38.473 |
| 2.2222222222222223 | 38.587 |
| 1.6666666666666667 | 38.716 |
| 1.3333333333333333 | 38.786 |
| 1.1111111111111112 | 38.845 |
| 3.3333333333333335 | 38.448 |
| 2.2222222222222223 | 38.562 |
| 1.6666666666666667 | 38.66 |
| 1.3333333333333333 | 38.717 |
| 1.1111111111111112 | 38.79 |
| 3.3333333333333335 | 38.42 |
| 2.2222222222222223 | 38.533 |
| 1.6666666666666667 | 38.603 |
| 1.3333333333333333 | 38.693 |
| 1.1111111111111112 | 38.736 |
| 4.0 | 38.937 |
| 2.6666666666666665 | 39.056 |
| 2.0 | 39.126 |
| 1.6 | 39.156 |
| 1.3333333333333333 | 39.153 |
| 4.0 | 38.733 |
| 2.6666666666666665 | 38.964 |
| 2.0 | 39.047 |
| 1.6 | 39.086 |
| 1.3333333333333333 | 39.107 |
| 4.0 | 38.613 |
| 2.6666666666666665 | 38.822 |
| 2.0 | 38.941 |
| 1.6 | 39.034 |
| 1.3333333333333333 | 39.05 |
| 4.0 | 38.509 |
| 2.6666666666666665 | 38.721 |
| 2.0 | 38.848 |
| 1.6 | 38.94 |
| 1.3333333333333333 | 39.003 |
| 4.0 | 38.465 |
| 2.6666666666666665 | 38.644 |
| 2.0 | 38.755 |
| 1.6 | 38.867 |
| 1.3333333333333333 | 38.934 |
| 4.0 | 38.443 |
| 2.6666666666666665 | 38.573 |
| 2.0 | 38.705 |
| 1.6 | 38.802 |
| 1.3333333333333333 | 38.858 |
| 4.0 | 38.418 |
| 2.6666666666666665 | 38.548 |
| 2.0 | 38.645 |
| 1.6 | 38.733 |
| 1.3333333333333333 | 38.802 |
| 4.0 | 38.388 |
| 2.6666666666666665 | 38.517 |
| 2.0 | 38.59 |
| 1.6 | 38.706 |
| 1.3333333333333333 | 38.747 |
| 4.666666666666667 | 38.958 |
| 3.111111111111111 | 39.056 |
| 2.3333333333333335 | 39.155 |
| 1.8666666666666667 | 39.159 |
| 1.5555555555555556 | 39.169 |
| 4.666666666666667 | 38.756 |
| 3.111111111111111 | 38.963 |
| 2.3333333333333335 | 39.072 |
| 1.8666666666666667 | 39.088 |
| 1.5555555555555556 | 39.121 |
| 4.666666666666667 | 38.634 |
| 3.111111111111111 | 38.818 |
| 2.3333333333333335 | 38.964 |
| 1.8666666666666667 | 39.032 |
| 1.5555555555555556 | 39.061 |
| 4.666666666666667 | 38.527 |
| 3.111111111111111 | 38.715 |
| 2.3333333333333335 | 38.87 |
| 1.8666666666666667 | 38.941 |
| 1.5555555555555556 | 39.011 |
| 4.666666666666667 | 38.478 |
| 3.111111111111111 | 38.635 |
| 2.3333333333333335 | 38.776 |
| 1.8666666666666667 | 38.865 |
| 1.5555555555555556 | 38.939 |
| 4.666666666666667 | 38.444 |
| 3.111111111111111 | 38.567 |
| 2.3333333333333335 | 38.716 |
| 1.8666666666666667 | 38.795 |
| 1.5555555555555556 | 38.865 |
| 4.666666666666667 | 38.415 |
| 3.111111111111111 | 38.536 |
| 2.3333333333333335 | 38.655 |
| 1.8666666666666667 | 38.725 |
| 1.5555555555555556 | 38.808 |
| 4.666666666666667 | 38.384 |
| 3.111111111111111 | 38.503 |
| 2.3333333333333335 | 38.597 |
| 1.8666666666666667 | 38.697 |
| 1.5555555555555556 | 38.751 |
| 5.333333333333333 | 38.959 |
| 3.5555555555555554 | 39.064 |
| 2.6666666666666665 | 39.152 |
| 2.1333333333333333 | 39.167 |
| 1.7777777777777777 | 39.169 |
| 5.333333333333333 | 38.752 |
| 3.5555555555555554 | 38.969 |
| 2.6666666666666665 | 39.068 |
| 2.1333333333333333 | 39.095 |
| 1.7777777777777777 | 39.12 |
| 5.333333333333333 | 38.63 |
| 3.5555555555555554 | 38.822 |
| 2.6666666666666665 | 38.958 |
| 2.1333333333333333 | 39.038 |
| 1.7777777777777777 | 39.058 |
| 5.333333333333333 | 38.525 |
| 3.5555555555555554 | 38.717 |
| 2.6666666666666665 | 38.861 |
| 2.1333333333333333 | 38.945 |
| 1.7777777777777777 | 39.007 |
| 5.333333333333333 | 38.475 |
| 3.5555555555555554 | 38.635 |
| 2.6666666666666665 | 38.765 |
| 2.1333333333333333 | 38.869 |
| 1.7777777777777777 | 38.935 |
| 5.333333333333333 | 38.444 |
| 3.5555555555555554 | 38.564 |
| 2.6666666666666665 | 38.703 |
| 2.1333333333333333 | 38.798 |
| 1.7777777777777777 | 38.86 |
| 5.333333333333333 | 38.412 |
| 3.5555555555555554 | 38.528 |
| 2.6666666666666665 | 38.644 |
| 2.1333333333333333 | 38.724 |
| 1.7777777777777777 | 38.808 |
| 5.333333333333333 | 38.38 |
| 3.5555555555555554 | 38.493 |
| 2.6666666666666665 | 38.586 |
| 2.1333333333333333 | 38.694 |
| 1.7777777777777777 | 38.75 |
| 6.0 | 38.956 |
| 4.0 | 39.045 |
| 3.0 | 39.142 |
| 2.4 | 39.182 |
| 2.0 | 39.176 |
| 6.0 | 38.748 |
| 4.0 | 38.948 |
| 3.0 | 39.055 |
| 2.4 | 39.11 |
| 2.0 | 39.125 |
| 6.0 | 38.627 |
| 4.0 | 38.8 |
| 3.0 | 38.945 |
| 2.4 | 39.052 |
| 2.0 | 39.062 |
| 6.0 | 38.521 |
| 4.0 | 38.694 |
| 3.0 | 38.85 |
| 2.4 | 38.959 |
| 2.0 | 39.009 |
| 6.0 | 38.473 |
| 4.0 | 38.61 |
| 3.0 | 38.753 |
| 2.4 | 38.882 |
| 2.0 | 38.934 |
| 6.0 | 38.439 |
| 4.0 | 38.539 |
| 3.0 | 38.692 |
| 2.4 | 38.809 |
| 2.0 | 38.858 |
| 6.0 | 38.408 |
| 4.0 | 38.501 |
| 3.0 | 38.63 |
| 2.4 | 38.735 |
| 2.0 | 38.803 |
| 6.0 | 38.386 |
| 4.0 | 38.467 |
| 3.0 | 38.582 |
| 2.4 | 38.696 |
| 2.0 | 38.739 |
| 1.3333333333333333 | 39.05 |
| 0.8888888888888888 | 39.087 |
| 0.6666666666666666 | 39.101 |
| 0.5333333333333333 | 39.045 |
| 0.4444444444444444 | 38.994 |
| 1.3333333333333333 | 38.886 |
| 0.8888888888888888 | 39.009 |
| 0.6666666666666666 | 39.091 |
| 0.5333333333333333 | 39.048 |
| 0.4444444444444444 | 39.019 |
| 1.3333333333333333 | 38.744 |
| 0.8888888888888888 | 38.904 |
| 0.6666666666666666 | 39.009 |
| 0.5333333333333333 | 39.019 |
| 0.4444444444444444 | 39.022 |
| 1.3333333333333333 | 38.655 |
| 0.8888888888888888 | 38.789 |
| 0.6666666666666666 | 38.932 |
| 0.5333333333333333 | 38.976 |
| 0.4444444444444444 | 38.992 |
| 1.3333333333333333 | 38.596 |
| 0.8888888888888888 | 38.71 |
| 0.6666666666666666 | 38.851 |
| 0.5333333333333333 | 38.918 |
| 0.4444444444444444 | 38.94 |
| 1.3333333333333333 | 38.57 |
| 0.8888888888888888 | 38.645 |
| 0.6666666666666666 | 38.764 |
| 0.5333333333333333 | 38.853 |
| 0.4444444444444444 | 38.884 |
| 1.3333333333333333 | 38.551 |
| 0.8888888888888888 | 38.584 |
| 0.6666666666666666 | 38.711 |
| 0.5333333333333333 | 38.788 |
| 0.4444444444444444 | 38.841 |
| 1.3333333333333333 | 38.527 |
| 0.8888888888888888 | 38.563 |
| 0.6666666666666666 | 38.664 |
| 0.5333333333333333 | 38.724 |
| 0.4444444444444444 | 38.796 |
| 2.0 | 39.098 |
| 1.3333333333333333 | 39.161 |
| 1.0 | 39.193 |
| 0.8 | 39.147 |
| 0.6666666666666666 | 39.104 |
| 2.0 | 38.923 |
| 1.3333333333333333 | 39.074 |
| 1.0 | 39.177 |
| 0.8 | 39.153 |
| 0.6666666666666666 | 39.127 |
| 2.0 | 38.775 |
| 1.3333333333333333 | 38.96 |
| 1.0 | 39.092 |
| 0.8 | 39.12 |
| 0.6666666666666666 | 39.126 |
| 2.0 | 38.677 |
| 1.3333333333333333 | 38.843 |
| 1.0 | 39.009 |
| 0.8 | 39.074 |
| 0.6666666666666666 | 39.095 |
| 2.0 | 38.612 |
| 1.3333333333333333 | 38.764 |
| 1.0 | 38.93 |
| 0.8 | 39.014 |
| 0.6666666666666666 | 39.042 |
| 2.0 | 38.579 |
| 1.3333333333333333 | 38.69 |
| 1.0 | 38.842 |
| 0.8 | 38.948 |
| 0.6666666666666666 | 38.985 |
| 2.0 | 38.561 |
| 1.3333333333333333 | 38.628 |
| 1.0 | 38.785 |
| 0.8 | 38.883 |
| 0.6666666666666666 | 38.941 |
| 2.0 | 38.534 |
| 1.3333333333333333 | 38.603 |
| 1.0 | 38.735 |
| 0.8 | 38.817 |
| 0.6666666666666666 | 38.896 |
| 2.6666666666666665 | 39.095 |
| 1.7777777777777777 | 39.215 |
| 1.3333333333333333 | 39.242 |
| 1.0666666666666667 | 39.21 |
| 0.8888888888888888 | 39.181 |
| 2.6666666666666665 | 38.916 |
| 1.7777777777777777 | 39.122 |
| 1.3333333333333333 | 39.221 |
| 1.0666666666666667 | 39.212 |
| 0.8888888888888888 | 39.202 |
| 2.6666666666666665 | 38.761 |
| 1.7777777777777777 | 39.002 |
| 1.3333333333333333 | 39.131 |
| 1.0666666666666667 | 39.176 |
| 0.8888888888888888 | 39.198 |
| 2.6666666666666665 | 38.658 |
| 1.7777777777777777 | 38.881 |
| 1.3333333333333333 | 39.049 |
| 1.0666666666666667 | 39.128 |
| 0.8888888888888888 | 39.165 |
| 2.6666666666666665 | 38.589 |
| 1.7777777777777777 | 38.8 |
| 1.3333333333333333 | 38.967 |
| 1.0666666666666667 | 39.066 |
| 0.8888888888888888 | 39.111 |
| 2.6666666666666665 | 38.553 |
| 1.7777777777777777 | 38.725 |
| 1.3333333333333333 | 38.881 |
| 1.0666666666666667 | 39 |
| 0.8888888888888888 | 39.053 |
| 2.6666666666666665 | 38.53 |
| 1.7777777777777777 | 38.66 |
| 1.3333333333333333 | 38.821 |
| 1.0666666666666667 | 38.934 |
| 0.8888888888888888 | 39.008 |
| 2.6666666666666665 | 38.502 |
| 1.7777777777777777 | 38.629 |
| 1.3333333333333333 | 38.767 |
| 1.0666666666666667 | 38.865 |
| 0.8888888888888888 | 38.963 |
| 3.3333333333333335 | 39.108 |
| 2.2222222222222223 | 39.216 |
| 1.6666666666666667 | 39.274 |
| 1.3333333333333333 | 39.253 |
| 1.1111111111111112 | 39.23 |
| 3.3333333333333335 | 38.921 |
| 2.2222222222222223 | 39.114 |
| 1.6666666666666667 | 39.249 |
| 1.3333333333333333 | 39.254 |
| 1.1111111111111112 | 39.25 |
| 3.3333333333333335 | 38.761 |
| 2.2222222222222223 | 38.995 |
| 1.6666666666666667 | 39.157 |
| 1.3333333333333333 | 39.218 |
| 1.1111111111111112 | 39.243 |
| 3.3333333333333335 | 38.654 |
| 2.2222222222222223 | 38.884 |
| 1.6666666666666667 | 39.071 |
| 1.3333333333333333 | 39.156 |
| 1.1111111111111112 | 39.208 |
| 3.3333333333333335 | 38.58 |
| 2.2222222222222223 | 38.8 |
| 1.6666666666666667 | 38.987 |
| 1.3333333333333333 | 39.093 |
| 1.1111111111111112 | 39.152 |
| 3.3333333333333335 | 38.543 |
| 2.2222222222222223 | 38.723 |
| 1.6666666666666667 | 38.897 |
| 1.3333333333333333 | 39.021 |
| 1.1111111111111112 | 39.094 |
| 3.3333333333333335 | 38.516 |
| 2.2222222222222223 | 38.658 |
| 1.6666666666666667 | 38.838 |
| 1.3333333333333333 | 38.954 |
| 1.1111111111111112 | 39.047 |
| 3.3333333333333335 | 38.485 |
| 2.2222222222222223 | 38.624 |
| 1.6666666666666667 | 38.784 |
| 1.3333333333333333 | 38.888 |
| 1.1111111111111112 | 39.001 |
| 4.0 | 39.113 |
| 2.6666666666666665 | 39.23 |
| 2.0 | 39.283 |
| 1.6 | 39.282 |
| 1.3333333333333333 | 39.255 |
| 4.0 | 38.925 |
| 2.6666666666666665 | 39.126 |
| 2.0 | 39.255 |
| 1.6 | 39.281 |
| 1.3333333333333333 | 39.272 |
| 4.0 | 38.761 |
| 2.6666666666666665 | 39.004 |
| 2.0 | 39.16 |
| 1.6 | 39.243 |
| 1.3333333333333333 | 39.263 |
| 4.0 | 38.65 |
| 2.6666666666666665 | 38.889 |
| 2.0 | 39.072 |
| 1.6 | 39.175 |
| 1.3333333333333333 | 39.225 |
| 4.0 | 38.569 |
| 2.6666666666666665 | 38.788 |
| 2.0 | 38.986 |
| 1.6 | 39.109 |
| 1.3333333333333333 | 39.171 |
| 4.0 | 38.532 |
| 2.6666666666666665 | 38.709 |
| 2.0 | 38.895 |
| 1.6 | 39.04 |
| 1.3333333333333333 | 39.111 |
| 4.0 | 38.504 |
| 2.6666666666666665 | 38.644 |
| 2.0 | 38.836 |
| 1.6 | 38.973 |
| 1.3333333333333333 | 39.063 |
| 4.0 | 38.471 |
| 2.6666666666666665 | 38.608 |
| 2.0 | 38.78 |
| 1.6 | 38.906 |
| 1.3333333333333333 | 39.017 |
| 4.666666666666667 | 39.111 |
| 3.111111111111111 | 39.228 |
| 2.3333333333333335 | 39.291 |
| 1.8666666666666667 | 39.293 |
| 1.5555555555555556 | 39.273 |
| 4.666666666666667 | 38.923 |
| 3.111111111111111 | 39.127 |
| 2.3333333333333335 | 39.253 |
| 1.8666666666666667 | 39.291 |
| 1.5555555555555556 | 39.286 |
| 4.666666666666667 | 38.756 |
| 3.111111111111111 | 39 |
| 2.3333333333333335 | 39.158 |
| 1.8666666666666667 | 39.25 |
| 1.5555555555555556 | 39.274 |
| 4.666666666666667 | 38.641 |
| 3.111111111111111 | 38.882 |
| 2.3333333333333335 | 39.067 |
| 1.8666666666666667 | 39.181 |
| 1.5555555555555556 | 39.234 |
| 4.666666666666667 | 38.559 |
| 3.111111111111111 | 38.779 |
| 2.3333333333333335 | 38.979 |
| 1.8666666666666667 | 39.114 |
| 1.5555555555555556 | 39.178 |
| 4.666666666666667 | 38.521 |
| 3.111111111111111 | 38.698 |
| 2.3333333333333335 | 38.902 |
| 1.8666666666666667 | 39.043 |
| 1.5555555555555556 | 39.125 |
| 4.666666666666667 | 38.493 |
| 3.111111111111111 | 38.631 |
| 2.3333333333333335 | 38.839 |
| 1.8666666666666667 | 38.975 |
| 1.5555555555555556 | 39.075 |
| 4.666666666666667 | 38.459 |
| 3.111111111111111 | 38.593 |
| 2.3333333333333335 | 38.782 |
| 1.8666666666666667 | 38.907 |
| 1.5555555555555556 | 39.028 |
| 5.333333333333333 | 39.105 |
| 3.5555555555555554 | 39.217 |
| 2.6666666666666665 | 39.289 |
| 2.1333333333333333 | 39.304 |
| 1.7777777777777777 | 39.282 |
| 5.333333333333333 | 38.916 |
| 3.5555555555555554 | 39.114 |
| 2.6666666666666665 | 39.255 |
| 2.1333333333333333 | 39.298 |
| 1.7777777777777777 | 39.298 |
| 5.333333333333333 | 38.751 |
| 3.5555555555555554 | 38.991 |
| 2.6666666666666665 | 39.158 |
| 2.1333333333333333 | 39.255 |
| 1.7777777777777777 | 39.287 |
| 5.333333333333333 | 38.636 |
| 3.5555555555555554 | 38.874 |
| 2.6666666666666665 | 39.067 |
| 2.1333333333333333 | 39.184 |
| 1.7777777777777777 | 39.247 |
| 5.333333333333333 | 38.554 |
| 3.5555555555555554 | 38.771 |
| 2.6666666666666665 | 38.977 |
| 2.1333333333333333 | 39.116 |
| 1.7777777777777777 | 39.191 |
| 5.333333333333333 | 38.515 |
| 3.5555555555555554 | 38.688 |
| 2.6666666666666665 | 38.901 |
| 2.1333333333333333 | 39.044 |
| 1.7777777777777777 | 39.137 |
| 5.333333333333333 | 38.481 |
| 3.5555555555555554 | 38.63 |
| 2.6666666666666665 | 38.823 |
| 2.1333333333333333 | 38.983 |
| 1.7777777777777777 | 39.076 |
| 5.333333333333333 | 38.447 |
| 3.5555555555555554 | 38.59 |
| 2.6666666666666665 | 38.766 |
| 2.1333333333333333 | 38.915 |
| 1.7777777777777777 | 39.023 |
| 6.0 | 39.096 |
| 4.0 | 39.232 |
| 3.0 | 39.289 |
| 2.4 | 39.302 |
| 2.0 | 39.295 |
| 6.0 | 38.904 |
| 4.0 | 39.129 |
| 3.0 | 39.255 |
| 2.4 | 39.294 |
| 2.0 | 39.31 |
| 6.0 | 38.736 |
| 4.0 | 39.004 |
| 3.0 | 39.156 |
| 2.4 | 39.25 |
| 2.0 | 39.297 |
| 6.0 | 38.62 |
| 4.0 | 38.884 |
| 3.0 | 39.065 |
| 2.4 | 39.178 |
| 2.0 | 39.256 |
| 6.0 | 38.536 |
| 4.0 | 38.78 |
| 3.0 | 38.973 |
| 2.4 | 39.107 |
| 2.0 | 39.197 |
| 6.0 | 38.496 |
| 4.0 | 38.695 |
| 3.0 | 38.897 |
| 2.4 | 39.034 |
| 2.0 | 39.143 |
| 6.0 | 38.461 |
| 4.0 | 38.635 |
| 3.0 | 38.817 |
| 2.4 | 38.971 |
| 2.0 | 39.077 |
| 6.0 | 38.427 |
| 4.0 | 38.582 |
| 3.0 | 38.759 |
| 2.4 | 38.903 |
| 2.0 | 39.023 |
| 1.3333333333333333 | 39.307 |
| 0.8888888888888888 | 39.181 |
| 0.6666666666666666 | 39.176 |
| 0.5333333333333333 | 39.073 |
| 0.4444444444444444 | 38.992 |
| 1.3333333333333333 | 39.27 |
| 0.8888888888888888 | 39.233 |
| 0.6666666666666666 | 39.244 |
| 0.5333333333333333 | 39.151 |
| 0.4444444444444444 | 39.098 |
| 1.3333333333333333 | 39.197 |
| 0.8888888888888888 | 39.211 |
| 0.6666666666666666 | 39.248 |
| 0.5333333333333333 | 39.198 |
| 0.4444444444444444 | 39.132 |
| 1.3333333333333333 | 39.109 |
| 0.8888888888888888 | 39.183 |
| 0.6666666666666666 | 39.242 |
| 0.5333333333333333 | 39.195 |
| 0.4444444444444444 | 39.162 |
| 1.3333333333333333 | 38.981 |
| 0.8888888888888888 | 39.108 |
| 0.6666666666666666 | 39.204 |
| 0.5333333333333333 | 39.191 |
| 0.4444444444444444 | 39.167 |
| 1.3333333333333333 | 38.887 |
| 0.8888888888888888 | 39.048 |
| 0.6666666666666666 | 39.178 |
| 0.5333333333333333 | 39.166 |
| 0.4444444444444444 | 39.151 |
| 1.3333333333333333 | 38.801 |
| 0.8888888888888888 | 38.992 |
| 0.6666666666666666 | 39.117 |
| 0.5333333333333333 | 39.127 |
| 0.4444444444444444 | 39.131 |
| 1.3333333333333333 | 38.742 |
| 0.8888888888888888 | 38.911 |
| 0.6666666666666666 | 39.089 |
| 0.5333333333333333 | 39.093 |
| 0.4444444444444444 | 39.113 |
| 2.0 | 39.362 |
| 1.3333333333333333 | 39.321 |
| 1.0 | 39.287 |
| 0.8 | 39.23 |
| 0.6666666666666666 | 39.175 |
| 2.0 | 39.314 |
| 1.3333333333333333 | 39.37 |
| 1.0 | 39.349 |
| 0.8 | 39.31 |
| 0.6666666666666666 | 39.271 |
| 2.0 | 39.236 |
| 1.3333333333333333 | 39.342 |
| 1.0 | 39.35 |
| 0.8 | 39.351 |
| 0.6666666666666666 | 39.301 |
| 2.0 | 39.143 |
| 1.3333333333333333 | 39.309 |
| 1.0 | 39.342 |
| 0.8 | 39.346 |
| 0.6666666666666666 | 39.33 |
| 2.0 | 39.014 |
| 1.3333333333333333 | 39.237 |
| 1.0 | 39.304 |
| 0.8 | 39.343 |
| 0.6666666666666666 | 39.335 |
| 2.0 | 38.929 |
| 1.3333333333333333 | 39.171 |
| 1.0 | 39.277 |
| 0.8 | 39.317 |
| 0.6666666666666666 | 39.317 |
| 2.0 | 38.83 |
| 1.3333333333333333 | 39.117 |
| 1.0 | 39.213 |
| 0.8 | 39.276 |
| 0.6666666666666666 | 39.297 |
| 2.0 | 38.765 |
| 1.3333333333333333 | 39.038 |
| 1.0 | 39.188 |
| 0.8 | 39.242 |
| 0.6666666666666666 | 39.279 |
| 2.6666666666666665 | 39.381 |
| 1.7777777777777777 | 39.36 |
| 1.3333333333333333 | 39.344 |
| 1.0666666666666667 | 39.318 |
| 0.8888888888888888 | 39.24 |
| 2.6666666666666665 | 39.328 |
| 1.7777777777777777 | 39.409 |
| 1.3333333333333333 | 39.403 |
| 1.0666666666666667 | 39.393 |
| 0.8888888888888888 | 39.333 |
| 2.6666666666666665 | 39.239 |
| 1.7777777777777777 | 39.374 |
| 1.3333333333333333 | 39.399 |
| 1.0666666666666667 | 39.429 |
| 0.8888888888888888 | 39.37 |
| 2.6666666666666665 | 39.134 |
| 1.7777777777777777 | 39.335 |
| 1.3333333333333333 | 39.388 |
| 1.0666666666666667 | 39.421 |
| 0.8888888888888888 | 39.397 |
| 2.6666666666666665 | 39.006 |
| 1.7777777777777777 | 39.259 |
| 1.3333333333333333 | 39.347 |
| 1.0666666666666667 | 39.414 |
| 0.8888888888888888 | 39.401 |
| 2.6666666666666665 | 38.928 |
| 1.7777777777777777 | 39.195 |
| 1.3333333333333333 | 39.32 |
| 1.0666666666666667 | 39.386 |
| 0.8888888888888888 | 39.382 |
| 2.6666666666666665 | 38.817 |
| 1.7777777777777777 | 39.14 |
| 1.3333333333333333 | 39.255 |
| 1.0666666666666667 | 39.344 |
| 0.8888888888888888 | 39.361 |
| 2.6666666666666665 | 38.763 |
| 1.7777777777777777 | 39.061 |
| 1.3333333333333333 | 39.229 |
| 1.0666666666666667 | 39.31 |
| 0.8888888888888888 | 39.343 |
| 3.3333333333333335 | 39.375 |
| 2.2222222222222223 | 39.393 |
| 1.6666666666666667 | 39.381 |
| 1.3333333333333333 | 39.357 |
| 1.1111111111111112 | 39.302 |
| 3.3333333333333335 | 39.326 |
| 2.2222222222222223 | 39.438 |
| 1.6666666666666667 | 39.437 |
| 1.3333333333333333 | 39.43 |
| 1.1111111111111112 | 39.394 |
| 3.3333333333333335 | 39.24 |
| 2.2222222222222223 | 39.401 |
| 1.6666666666666667 | 39.43 |
| 1.3333333333333333 | 39.464 |
| 1.1111111111111112 | 39.428 |
| 3.3333333333333335 | 39.134 |
| 2.2222222222222223 | 39.356 |
| 1.6666666666666667 | 39.415 |
| 1.3333333333333333 | 39.45 |
| 1.1111111111111112 | 39.453 |
| 3.3333333333333335 | 39.006 |
| 2.2222222222222223 | 39.281 |
| 1.6666666666666667 | 39.373 |
| 1.3333333333333333 | 39.441 |
| 1.1111111111111112 | 39.456 |
| 3.3333333333333335 | 38.925 |
| 2.2222222222222223 | 39.216 |
| 1.6666666666666667 | 39.344 |
| 1.3333333333333333 | 39.412 |
| 1.1111111111111112 | 39.436 |
| 3.3333333333333335 | 38.81 |
| 2.2222222222222223 | 39.159 |
| 1.6666666666666667 | 39.278 |
| 1.3333333333333333 | 39.369 |
| 1.1111111111111112 | 39.414 |
| 3.3333333333333335 | 38.76 |
| 2.2222222222222223 | 39.08 |
| 1.6666666666666667 | 39.25 |
| 1.3333333333333333 | 39.334 |
| 1.1111111111111112 | 39.396 |
| 4.0 | 39.365 |
| 2.6666666666666665 | 39.387 |
| 2.0 | 39.398 |
| 1.6 | 39.402 |
| 1.3333333333333333 | 39.331 |
| 4.0 | 39.31 |
| 2.6666666666666665 | 39.427 |
| 2.0 | 39.454 |
| 1.6 | 39.47 |
| 1.3333333333333333 | 39.423 |
| 4.0 | 39.22 |
| 2.6666666666666665 | 39.385 |
| 2.0 | 39.444 |
| 1.6 | 39.503 |
| 1.3333333333333333 | 39.457 |
| 4.0 | 39.113 |
| 2.6666666666666665 | 39.337 |
| 2.0 | 39.428 |
| 1.6 | 39.486 |
| 1.3333333333333333 | 39.48 |
| 4.0 | 39.001 |
| 2.6666666666666665 | 39.264 |
| 2.0 | 39.384 |
| 1.6 | 39.475 |
| 1.3333333333333333 | 39.472 |
| 4.0 | 38.916 |
| 2.6666666666666665 | 39.197 |
| 2.0 | 39.354 |
| 1.6 | 39.446 |
| 1.3333333333333333 | 39.45 |
| 4.0 | 38.802 |
| 2.6666666666666665 | 39.138 |
| 2.0 | 39.288 |
| 1.6 | 39.401 |
| 1.3333333333333333 | 39.428 |
| 4.0 | 38.749 |
| 2.6666666666666665 | 39.06 |
| 2.0 | 39.259 |
| 1.6 | 39.365 |
| 1.3333333333333333 | 39.409 |
| 4.666666666666667 | 39.382 |
| 3.111111111111111 | 39.394 |
| 2.3333333333333335 | 39.43 |
| 1.8666666666666667 | 39.411 |
| 1.5555555555555556 | 39.352 |
| 4.666666666666667 | 39.324 |
| 3.111111111111111 | 39.435 |
| 2.3333333333333335 | 39.485 |
| 1.8666666666666667 | 39.479 |
| 1.5555555555555556 | 39.442 |
| 4.666666666666667 | 39.23 |
| 3.111111111111111 | 39.391 |
| 2.3333333333333335 | 39.474 |
| 1.8666666666666667 | 39.51 |
| 1.5555555555555556 | 39.475 |
| 4.666666666666667 | 39.12 |
| 3.111111111111111 | 39.342 |
| 2.3333333333333335 | 39.457 |
| 1.8666666666666667 | 39.493 |
| 1.5555555555555556 | 39.498 |
| 4.666666666666667 | 39.009 |
| 3.111111111111111 | 39.268 |
| 2.3333333333333335 | 39.411 |
| 1.8666666666666667 | 39.48 |
| 1.5555555555555556 | 39.488 |
| 4.666666666666667 | 38.9 |
| 3.111111111111111 | 39.2 |
| 2.3333333333333335 | 39.368 |
| 1.8666666666666667 | 39.449 |
| 1.5555555555555556 | 39.47 |
| 4.666666666666667 | 38.784 |
| 3.111111111111111 | 39.14 |
| 2.3333333333333335 | 39.3 |
| 1.8666666666666667 | 39.403 |
| 1.5555555555555556 | 39.447 |
| 4.666666666666667 | 38.732 |
| 3.111111111111111 | 39.062 |
| 2.3333333333333335 | 39.27 |
| 1.8666666666666667 | 39.367 |
| 1.5555555555555556 | 39.427 |
| 5.333333333333333 | 39.359 |
| 3.5555555555555554 | 39.403 |
| 2.6666666666666665 | 39.422 |
| 2.1333333333333333 | 39.413 |
| 1.7777777777777777 | 39.366 |
| 5.333333333333333 | 39.306 |
| 3.5555555555555554 | 39.446 |
| 2.6666666666666665 | 39.475 |
| 2.1333333333333333 | 39.48 |
| 1.7777777777777777 | 39.456 |
| 5.333333333333333 | 39.22 |
| 3.5555555555555554 | 39.404 |
| 2.6666666666666665 | 39.463 |
| 2.1333333333333333 | 39.512 |
| 1.7777777777777777 | 39.487 |
| 5.333333333333333 | 39.106 |
| 3.5555555555555554 | 39.356 |
| 2.6666666666666665 | 39.447 |
| 2.1333333333333333 | 39.494 |
| 1.7777777777777777 | 39.509 |
| 5.333333333333333 | 38.989 |
| 3.5555555555555554 | 39.281 |
| 2.6666666666666665 | 39.401 |
| 2.1333333333333333 | 39.481 |
| 1.7777777777777777 | 39.498 |
| 5.333333333333333 | 38.875 |
| 3.5555555555555554 | 39.211 |
| 2.6666666666666665 | 39.358 |
| 2.1333333333333333 | 39.45 |
| 1.7777777777777777 | 39.48 |
| 5.333333333333333 | 38.769 |
| 3.5555555555555554 | 39.145 |
| 2.6666666666666665 | 39.299 |
| 2.1333333333333333 | 39.409 |
| 1.7777777777777777 | 39.461 |
| 5.333333333333333 | 38.716 |
| 3.5555555555555554 | 39.066 |
| 2.6666666666666665 | 39.268 |
| 2.1333333333333333 | 39.372 |
| 1.7777777777777777 | 39.44 |
| 6.0 | 39.361 |
| 4.0 | 39.401 |
| 3.0 | 39.446 |
| 2.4 | 39.425 |
| 2.0 | 39.382 |
| 6.0 | 39.301 |
| 4.0 | 39.44 |
| 3.0 | 39.5 |
| 2.4 | 39.491 |
| 2.0 | 39.471 |
| 6.0 | 39.207 |
| 4.0 | 39.396 |
| 3.0 | 39.489 |
| 2.4 | 39.522 |
| 2.0 | 39.503 |
| 6.0 | 39.095 |
| 4.0 | 39.345 |
| 3.0 | 39.472 |
| 2.4 | 39.504 |
| 2.0 | 39.525 |
| 6.0 | 38.983 |
| 4.0 | 39.269 |
| 3.0 | 39.427 |
| 2.4 | 39.49 |
| 2.0 | 39.513 |
| 6.0 | 38.874 |
| 4.0 | 39.199 |
| 3.0 | 39.382 |
| 2.4 | 39.458 |
| 2.0 | 39.494 |
| 6.0 | 38.774 |
| 4.0 | 39.133 |
| 3.0 | 39.322 |
| 2.4 | 39.417 |
| 2.0 | 39.474 |
| 6.0 | 38.714 |
| 4.0 | 39.056 |
| 3.0 | 39.273 |
| 2.4 | 39.376 |
| 2.0 | 39.443 |
| 1.3333333333333333 | 39.264 |
| 0.8888888888888888 | 39.215 |
| 0.6666666666666666 | 39.13 |
| 0.5333333333333333 | 39.118 |
| 0.4444444444444444 | 39.046 |
| 1.3333333333333333 | 39.293 |
| 0.8888888888888888 | 39.319 |
| 0.6666666666666666 | 39.241 |
| 0.5333333333333333 | 39.221 |
| 0.4444444444444444 | 39.168 |
| 1.3333333333333333 | 39.278 |
| 0.8888888888888888 | 39.335 |
| 0.6666666666666666 | 39.291 |
| 0.5333333333333333 | 39.293 |
| 0.4444444444444444 | 39.235 |
| 1.3333333333333333 | 39.251 |
| 0.8888888888888888 | 39.332 |
| 0.6666666666666666 | 39.309 |
| 0.5333333333333333 | 39.324 |
| 0.4444444444444444 | 39.281 |
| 1.3333333333333333 | 39.194 |
| 0.8888888888888888 | 39.314 |
| 0.6666666666666666 | 39.31 |
| 0.5333333333333333 | 39.34 |
| 0.4444444444444444 | 39.302 |
| 1.3333333333333333 | 39.149 |
| 0.8888888888888888 | 39.293 |
| 0.6666666666666666 | 39.308 |
| 0.5333333333333333 | 39.336 |
| 0.4444444444444444 | 39.313 |
| 1.3333333333333333 | 39.097 |
| 0.8888888888888888 | 39.262 |
| 0.6666666666666666 | 39.295 |
| 0.5333333333333333 | 39.344 |
| 0.4444444444444444 | 39.317 |
| 1.3333333333333333 | 39.053 |
| 0.8888888888888888 | 39.216 |
| 0.6666666666666666 | 39.275 |
| 0.5333333333333333 | 39.327 |
| 0.4444444444444444 | 39.308 |
| 2.0 | 39.308 |
| 1.3333333333333333 | 39.292 |
| 1.0 | 39.204 |
| 0.8 | 39.205 |
| 0.6666666666666666 | 39.138 |
| 2.0 | 39.328 |
| 1.3333333333333333 | 39.389 |
| 1.0 | 39.31 |
| 0.8 | 39.304 |
| 0.6666666666666666 | 39.258 |
| 2.0 | 39.308 |
| 1.3333333333333333 | 39.402 |
| 1.0 | 39.356 |
| 0.8 | 39.373 |
| 0.6666666666666666 | 39.322 |
| 2.0 | 39.279 |
| 1.3333333333333333 | 39.396 |
| 1.0 | 39.369 |
| 0.8 | 39.402 |
| 0.6666666666666666 | 39.367 |
| 2.0 | 39.221 |
| 1.3333333333333333 | 39.378 |
| 1.0 | 39.369 |
| 0.8 | 39.416 |
| 0.6666666666666666 | 39.388 |
| 2.0 | 39.176 |
| 1.3333333333333333 | 39.356 |
| 1.0 | 39.366 |
| 0.8 | 39.413 |
| 0.6666666666666666 | 39.398 |
| 2.0 | 39.123 |
| 1.3333333333333333 | 39.325 |
| 1.0 | 39.353 |
| 0.8 | 39.42 |
| 0.6666666666666666 | 39.402 |
| 2.0 | 39.079 |
| 1.3333333333333333 | 39.278 |
| 1.0 | 39.333 |
| 0.8 | 39.402 |
| 0.6666666666666666 | 39.392 |
| 2.6666666666666665 | 39.317 |
| 1.7777777777777777 | 39.323 |
| 1.3333333333333333 | 39.238 |
| 1.0666666666666667 | 39.24 |
| 0.8888888888888888 | 39.194 |
| 2.6666666666666665 | 39.331 |
| 1.7777777777777777 | 39.416 |
| 1.3333333333333333 | 39.341 |
| 1.0666666666666667 | 39.336 |
| 0.8888888888888888 | 39.311 |
| 2.6666666666666665 | 39.306 |
| 1.7777777777777777 | 39.424 |
| 1.3333333333333333 | 39.382 |
| 1.0666666666666667 | 39.402 |
| 0.8888888888888888 | 39.374 |
| 2.6666666666666665 | 39.272 |
| 1.7777777777777777 | 39.415 |
| 1.3333333333333333 | 39.393 |
| 1.0666666666666667 | 39.43 |
| 0.8888888888888888 | 39.416 |
| 2.6666666666666665 | 39.214 |
| 1.7777777777777777 | 39.395 |
| 1.3333333333333333 | 39.392 |
| 1.0666666666666667 | 39.442 |
| 0.8888888888888888 | 39.436 |
| 2.6666666666666665 | 39.167 |
| 1.7777777777777777 | 39.372 |
| 1.3333333333333333 | 39.387 |
| 1.0666666666666667 | 39.438 |
| 0.8888888888888888 | 39.445 |
| 2.6666666666666665 | 39.114 |
| 1.7777777777777777 | 39.341 |
| 1.3333333333333333 | 39.374 |
| 1.0666666666666667 | 39.444 |
| 0.8888888888888888 | 39.448 |
| 2.6666666666666665 | 39.069 |
| 1.7777777777777777 | 39.294 |
| 1.3333333333333333 | 39.354 |
| 1.0666666666666667 | 39.426 |
| 0.8888888888888888 | 39.438 |
| 3.3333333333333335 | 39.323 |
| 2.2222222222222223 | 39.337 |
| 1.6666666666666667 | 39.266 |
| 1.3333333333333333 | 39.28 |
| 1.1111111111111112 | 39.221 |
| 3.3333333333333335 | 39.335 |
| 2.2222222222222223 | 39.427 |
| 1.6666666666666667 | 39.366 |
| 1.3333333333333333 | 39.375 |
| 1.1111111111111112 | 39.336 |
| 3.3333333333333335 | 39.307 |
| 2.2222222222222223 | 39.432 |
| 1.6666666666666667 | 39.405 |
| 1.3333333333333333 | 39.438 |
| 1.1111111111111112 | 39.397 |
| 3.3333333333333335 | 39.27 |
| 2.2222222222222223 | 39.42 |
| 1.6666666666666667 | 39.413 |
| 1.3333333333333333 | 39.464 |
| 1.1111111111111112 | 39.438 |
| 3.3333333333333335 | 39.21 |
| 2.2222222222222223 | 39.399 |
| 1.6666666666666667 | 39.41 |
| 1.3333333333333333 | 39.475 |
| 1.1111111111111112 | 39.456 |
| 3.3333333333333335 | 39.159 |
| 2.2222222222222223 | 39.375 |
| 1.6666666666666667 | 39.404 |
| 1.3333333333333333 | 39.469 |
| 1.1111111111111112 | 39.465 |
| 3.3333333333333335 | 39.109 |
| 2.2222222222222223 | 39.342 |
| 1.6666666666666667 | 39.39 |
| 1.3333333333333333 | 39.475 |
| 1.1111111111111112 | 39.468 |
| 3.3333333333333335 | 39.064 |
| 2.2222222222222223 | 39.295 |
| 1.6666666666666667 | 39.369 |
| 1.3333333333333333 | 39.457 |
| 1.1111111111111112 | 39.457 |
| 4.0 | 39.308 |
| 2.6666666666666665 | 39.342 |
| 2.0 | 39.282 |
| 1.6 | 39.308 |
| 1.3333333333333333 | 39.251 |
| 4.0 | 39.319 |
| 2.6666666666666665 | 39.431 |
| 2.0 | 39.381 |
| 1.6 | 39.4 |
| 1.3333333333333333 | 39.366 |
| 4.0 | 39.289 |
| 2.6666666666666665 | 39.434 |
| 2.0 | 39.419 |
| 1.6 | 39.463 |
| 1.3333333333333333 | 39.425 |
| 4.0 | 39.251 |
| 2.6666666666666665 | 39.421 |
| 2.0 | 39.424 |
| 1.6 | 39.487 |
| 1.3333333333333333 | 39.465 |
| 4.0 | 39.189 |
| 2.6666666666666665 | 39.397 |
| 2.0 | 39.42 |
| 1.6 | 39.496 |
| 1.3333333333333333 | 39.482 |
| 4.0 | 39.137 |
| 2.6666666666666665 | 39.372 |
| 2.0 | 39.413 |
| 1.6 | 39.489 |
| 1.3333333333333333 | 39.489 |
| 4.0 | 39.086 |
| 2.6666666666666665 | 39.338 |
| 2.0 | 39.398 |
| 1.6 | 39.494 |
| 1.3333333333333333 | 39.491 |
| 4.0 | 39.038 |
| 2.6666666666666665 | 39.291 |
| 2.0 | 39.377 |
| 1.6 | 39.474 |
| 1.3333333333333333 | 39.48 |
| 4.666666666666667 | 39.307 |
| 3.111111111111111 | 39.349 |
| 2.3333333333333335 | 39.296 |
| 1.8666666666666667 | 39.318 |
| 1.5555555555555556 | 39.273 |
| 4.666666666666667 | 39.317 |
| 3.111111111111111 | 39.438 |
| 2.3333333333333335 | 39.395 |
| 1.8666666666666667 | 39.411 |
| 1.5555555555555556 | 39.387 |
| 4.666666666666667 | 39.287 |
| 3.111111111111111 | 39.44 |
| 2.3333333333333335 | 39.431 |
| 1.8666666666666667 | 39.472 |
| 1.5555555555555556 | 39.445 |
| 4.666666666666667 | 39.248 |
| 3.111111111111111 | 39.425 |
| 2.3333333333333335 | 39.435 |
| 1.8666666666666667 | 39.495 |
| 1.5555555555555556 | 39.485 |
| 4.666666666666667 | 39.186 |
| 3.111111111111111 | 39.4 |
| 2.3333333333333335 | 39.43 |
| 1.8666666666666667 | 39.503 |
| 1.5555555555555556 | 39.5 |
| 4.666666666666667 | 39.132 |
| 3.111111111111111 | 39.373 |
| 2.3333333333333335 | 39.422 |
| 1.8666666666666667 | 39.495 |
| 1.5555555555555556 | 39.506 |
| 4.666666666666667 | 39.08 |
| 3.111111111111111 | 39.339 |
| 2.3333333333333335 | 39.405 |
| 1.8666666666666667 | 39.498 |
| 1.5555555555555556 | 39.508 |
| 4.666666666666667 | 39.031 |
| 3.111111111111111 | 39.291 |
| 2.3333333333333335 | 39.384 |
| 1.8666666666666667 | 39.479 |
| 1.5555555555555556 | 39.496 |
| 5.333333333333333 | 39.301 |
| 3.5555555555555554 | 39.349 |
| 2.6666666666666665 | 39.304 |
| 2.1333333333333333 | 39.341 |
| 1.7777777777777777 | 39.29 |
| 5.333333333333333 | 39.311 |
| 3.5555555555555554 | 39.438 |
| 2.6666666666666665 | 39.401 |
| 2.1333333333333333 | 39.432 |
| 1.7777777777777777 | 39.404 |
| 5.333333333333333 | 39.28 |
| 3.5555555555555554 | 39.439 |
| 2.6666666666666665 | 39.437 |
| 2.1333333333333333 | 39.489 |
| 1.7777777777777777 | 39.461 |
| 5.333333333333333 | 39.241 |
| 3.5555555555555554 | 39.424 |
| 2.6666666666666665 | 39.44 |
| 2.1333333333333333 | 39.515 |
| 1.7777777777777777 | 39.5 |
| 5.333333333333333 | 39.178 |
| 3.5555555555555554 | 39.398 |
| 2.6666666666666665 | 39.434 |
| 2.1333333333333333 | 39.522 |
| 1.7777777777777777 | 39.515 |
| 5.333333333333333 | 39.124 |
| 3.5555555555555554 | 39.37 |
| 2.6666666666666665 | 39.425 |
| 2.1333333333333333 | 39.513 |
| 1.7777777777777777 | 39.52 |
| 5.333333333333333 | 39.071 |
| 3.5555555555555554 | 39.335 |
| 2.6666666666666665 | 39.408 |
| 2.1333333333333333 | 39.516 |
| 1.7777777777777777 | 39.521 |
| 5.333333333333333 | 39.022 |
| 3.5555555555555554 | 39.286 |
| 2.6666666666666665 | 39.385 |
| 2.1333333333333333 | 39.496 |
| 1.7777777777777777 | 39.509 |
| 6.0 | 39.298 |
| 4.0 | 39.337 |
| 3.0 | 39.307 |
| 2.4 | 39.341 |
| 2.0 | 39.294 |
| 6.0 | 39.308 |
| 4.0 | 39.425 |
| 3.0 | 39.404 |
| 2.4 | 39.432 |
| 2.0 | 39.408 |
| 6.0 | 39.277 |
| 4.0 | 39.426 |
| 3.0 | 39.439 |
| 2.4 | 39.488 |
| 2.0 | 39.465 |
| 6.0 | 39.237 |
| 4.0 | 39.41 |
| 3.0 | 39.442 |
| 2.4 | 39.51 |
| 2.0 | 39.504 |
| 6.0 | 39.174 |
| 4.0 | 39.384 |
| 3.0 | 39.436 |
| 2.4 | 39.52 |
| 2.0 | 39.518 |
| 6.0 | 39.119 |
| 4.0 | 39.356 |
| 3.0 | 39.426 |
| 2.4 | 39.51 |
| 2.0 | 39.523 |
| 6.0 | 39.066 |
| 4.0 | 39.321 |
| 3.0 | 39.408 |
| 2.4 | 39.513 |
| 2.0 | 39.522 |
| 6.0 | 39.016 |
| 4.0 | 39.272 |
| 3.0 | 39.385 |
| 2.4 | 39.493 |
| 2.0 | 39.51 |
| 1.3333333333333333 | 39.176 |
| 0.8888888888888888 | 39.111 |
| 0.6666666666666666 | 39.074 |
| 0.5333333333333333 | 39.046 |
| 0.4444444444444444 | 38.998 |
| 1.3333333333333333 | 39.205 |
| 0.8888888888888888 | 39.215 |
| 0.6666666666666666 | 39.181 |
| 0.5333333333333333 | 39.157 |
| 0.4444444444444444 | 39.125 |
| 1.3333333333333333 | 39.189 |
| 0.8888888888888888 | 39.229 |
| 0.6666666666666666 | 39.227 |
| 0.5333333333333333 | 39.235 |
| 0.4444444444444444 | 39.193 |
| 1.3333333333333333 | 39.137 |
| 0.8888888888888888 | 39.23 |
| 0.6666666666666666 | 39.254 |
| 0.5333333333333333 | 39.253 |
| 0.4444444444444444 | 39.247 |
| 1.3333333333333333 | 39.089 |
| 0.8888888888888888 | 39.203 |
| 0.6666666666666666 | 39.251 |
| 0.5333333333333333 | 39.276 |
| 0.4444444444444444 | 39.265 |
| 1.3333333333333333 | 39.032 |
| 0.8888888888888888 | 39.172 |
| 0.6666666666666666 | 39.24 |
| 0.5333333333333333 | 39.274 |
| 0.4444444444444444 | 39.271 |
| 1.3333333333333333 | 38.977 |
| 0.8888888888888888 | 39.141 |
| 0.6666666666666666 | 39.215 |
| 0.5333333333333333 | 39.263 |
| 0.4444444444444444 | 39.274 |
| 1.3333333333333333 | 38.934 |
| 0.8888888888888888 | 39.095 |
| 0.6666666666666666 | 39.193 |
| 0.5333333333333333 | 39.25 |
| 0.4444444444444444 | 39.273 |
| 2.0 | 39.171 |
| 1.3333333333333333 | 39.167 |
| 1.0 | 39.142 |
| 0.8 | 39.094 |
| 0.6666666666666666 | 39.035 |
| 2.0 | 39.19 |
| 1.3333333333333333 | 39.268 |
| 1.0 | 39.244 |
| 0.8 | 39.21 |
| 0.6666666666666666 | 39.162 |
| 2.0 | 39.165 |
| 1.3333333333333333 | 39.277 |
| 1.0 | 39.287 |
| 0.8 | 39.281 |
| 0.6666666666666666 | 39.226 |
| 2.0 | 39.115 |
| 1.3333333333333333 | 39.277 |
| 1.0 | 39.313 |
| 0.8 | 39.298 |
| 0.6666666666666666 | 39.279 |
| 2.0 | 39.063 |
| 1.3333333333333333 | 39.244 |
| 1.0 | 39.309 |
| 0.8 | 39.319 |
| 0.6666666666666666 | 39.298 |
| 2.0 | 39.005 |
| 1.3333333333333333 | 39.213 |
| 1.0 | 39.299 |
| 0.8 | 39.316 |
| 0.6666666666666666 | 39.302 |
| 2.0 | 38.951 |
| 1.3333333333333333 | 39.184 |
| 1.0 | 39.271 |
| 0.8 | 39.306 |
| 0.6666666666666666 | 39.305 |
| 2.0 | 38.906 |
| 1.3333333333333333 | 39.138 |
| 1.0 | 39.248 |
| 0.8 | 39.292 |
| 0.6666666666666666 | 39.305 |
| 2.6666666666666665 | 39.145 |
| 1.7777777777777777 | 39.159 |
| 1.3333333333333333 | 39.153 |
| 1.0666666666666667 | 39.142 |
| 0.8888888888888888 | 39.08 |
| 2.6666666666666665 | 39.157 |
| 1.7777777777777777 | 39.25 |
| 1.3333333333333333 | 39.254 |
| 1.0666666666666667 | 39.254 |
| 0.8888888888888888 | 39.199 |
| 2.6666666666666665 | 39.129 |
| 1.7777777777777777 | 39.256 |
| 1.3333333333333333 | 39.289 |
| 1.0666666666666667 | 39.322 |
| 0.8888888888888888 | 39.266 |
| 2.6666666666666665 | 39.075 |
| 1.7777777777777777 | 39.252 |
| 1.3333333333333333 | 39.311 |
| 1.0666666666666667 | 39.337 |
| 0.8888888888888888 | 39.316 |
| 2.6666666666666665 | 39.022 |
| 1.7777777777777777 | 39.221 |
| 1.3333333333333333 | 39.305 |
| 1.0666666666666667 | 39.357 |
| 0.8888888888888888 | 39.332 |
| 2.6666666666666665 | 38.962 |
| 1.7777777777777777 | 39.188 |
| 1.3333333333333333 | 39.296 |
| 1.0666666666666667 | 39.354 |
| 0.8888888888888888 | 39.337 |
| 2.6666666666666665 | 38.905 |
| 1.7777777777777777 | 39.159 |
| 1.3333333333333333 | 39.266 |
| 1.0666666666666667 | 39.342 |
| 0.8888888888888888 | 39.339 |
| 2.6666666666666665 | 38.864 |
| 1.7777777777777777 | 39.112 |
| 1.3333333333333333 | 39.242 |
| 1.0666666666666667 | 39.329 |
| 0.8888888888888888 | 39.338 |
| 3.3333333333333335 | 39.107 |
| 2.2222222222222223 | 39.158 |
| 1.6666666666666667 | 39.162 |
| 1.3333333333333333 | 39.142 |
| 1.1111111111111112 | 39.115 |
| 3.3333333333333335 | 39.113 |
| 2.2222222222222223 | 39.244 |
| 1.6666666666666667 | 39.26 |
| 1.3333333333333333 | 39.252 |
| 1.1111111111111112 | 39.233 |
| 3.3333333333333335 | 39.081 |
| 2.2222222222222223 | 39.244 |
| 1.6666666666666667 | 39.291 |
| 1.3333333333333333 | 39.318 |
| 1.1111111111111112 | 39.297 |
| 3.3333333333333335 | 39.023 |
| 2.2222222222222223 | 39.237 |
| 1.6666666666666667 | 39.31 |
| 1.3333333333333333 | 39.331 |
| 1.1111111111111112 | 39.346 |
| 3.3333333333333335 | 38.967 |
| 2.2222222222222223 | 39.204 |
| 1.6666666666666667 | 39.303 |
| 1.3333333333333333 | 39.349 |
| 1.1111111111111112 | 39.36 |
| 3.3333333333333335 | 38.905 |
| 2.2222222222222223 | 39.17 |
| 1.6666666666666667 | 39.294 |
| 1.3333333333333333 | 39.344 |
| 1.1111111111111112 | 39.364 |
| 3.3333333333333335 | 38.849 |
| 2.2222222222222223 | 39.14 |
| 1.6666666666666667 | 39.264 |
| 1.3333333333333333 | 39.331 |
| 1.1111111111111112 | 39.366 |
| 3.3333333333333335 | 38.808 |
| 2.2222222222222223 | 39.093 |
| 1.6666666666666667 | 39.239 |
| 1.3333333333333333 | 39.317 |
| 1.1111111111111112 | 39.364 |
| 4.0 | 39.091 |
| 2.6666666666666665 | 39.13 |
| 2.0 | 39.15 |
| 1.6 | 39.154 |
| 1.3333333333333333 | 39.115 |
| 4.0 | 39.097 |
| 2.6666666666666665 | 39.215 |
| 2.0 | 39.246 |
| 1.6 | 39.258 |
| 1.3333333333333333 | 39.236 |
| 4.0 | 39.066 |
| 2.6666666666666665 | 39.214 |
| 2.0 | 39.275 |
| 1.6 | 39.322 |
| 1.3333333333333333 | 39.292 |
| 4.0 | 39.008 |
| 2.6666666666666665 | 39.207 |
| 2.0 | 39.293 |
| 1.6 | 39.333 |
| 1.3333333333333333 | 39.345 |
| 4.0 | 38.944 |
| 2.6666666666666665 | 39.17 |
| 2.0 | 39.284 |
| 1.6 | 39.35 |
| 1.3333333333333333 | 39.357 |
| 4.0 | 38.88 |
| 2.6666666666666665 | 39.134 |
| 2.0 | 39.275 |
| 1.6 | 39.344 |
| 1.3333333333333333 | 39.361 |
| 4.0 | 38.823 |
| 2.6666666666666665 | 39.103 |
| 2.0 | 39.245 |
| 1.6 | 39.331 |
| 1.3333333333333333 | 39.362 |
| 4.0 | 38.78 |
| 2.6666666666666665 | 39.055 |
| 2.0 | 39.22 |
| 1.6 | 39.316 |
| 1.3333333333333333 | 39.359 |
| 4.666666666666667 | 39.084 |
| 3.111111111111111 | 39.111 |
| 2.3333333333333335 | 39.161 |
| 1.8666666666666667 | 39.154 |
| 1.5555555555555556 | 39.116 |
| 4.666666666666667 | 39.089 |
| 3.111111111111111 | 39.194 |
| 2.3333333333333335 | 39.251 |
| 1.8666666666666667 | 39.256 |
| 1.5555555555555556 | 39.234 |
| 4.666666666666667 | 39.055 |
| 3.111111111111111 | 39.19 |
| 2.3333333333333335 | 39.274 |
| 1.8666666666666667 | 39.318 |
| 1.5555555555555556 | 39.288 |
| 4.666666666666667 | 38.996 |
| 3.111111111111111 | 39.181 |
| 2.3333333333333335 | 39.289 |
| 1.8666666666666667 | 39.329 |
| 1.5555555555555556 | 39.339 |
| 4.666666666666667 | 38.93 |
| 3.111111111111111 | 39.142 |
| 2.3333333333333335 | 39.275 |
| 1.8666666666666667 | 39.343 |
| 1.5555555555555556 | 39.349 |
| 4.666666666666667 | 38.865 |
| 3.111111111111111 | 39.105 |
| 2.3333333333333335 | 39.261 |
| 1.8666666666666667 | 39.336 |
| 1.5555555555555556 | 39.353 |
| 4.666666666666667 | 38.808 |
| 3.111111111111111 | 39.073 |
| 2.3333333333333335 | 39.231 |
| 1.8666666666666667 | 39.322 |
| 1.5555555555555556 | 39.353 |
| 4.666666666666667 | 38.766 |
| 3.111111111111111 | 39.024 |
| 2.3333333333333335 | 39.205 |
| 1.8666666666666667 | 39.307 |
| 1.5555555555555556 | 39.35 |
| 5.333333333333333 | 39.082 |
| 3.5555555555555554 | 39.105 |
| 2.6666666666666665 | 39.137 |
| 2.1333333333333333 | 39.144 |
| 1.7777777777777777 | 39.122 |
| 5.333333333333333 | 39.084 |
| 3.5555555555555554 | 39.186 |
| 2.6666666666666665 | 39.225 |
| 2.1333333333333333 | 39.244 |
| 1.7777777777777777 | 39.24 |
| 5.333333333333333 | 39.042 |
| 3.5555555555555554 | 39.18 |
| 2.6666666666666665 | 39.248 |
| 2.1333333333333333 | 39.306 |
| 1.7777777777777777 | 39.293 |
| 5.333333333333333 | 38.98 |
| 3.5555555555555554 | 39.169 |
| 2.6666666666666665 | 39.263 |
| 2.1333333333333333 | 39.315 |
| 1.7777777777777777 | 39.342 |
| 5.333333333333333 | 38.913 |
| 3.5555555555555554 | 39.129 |
| 2.6666666666666665 | 39.251 |
| 2.1333333333333333 | 39.328 |
| 1.7777777777777777 | 39.352 |
| 5.333333333333333 | 38.847 |
| 3.5555555555555554 | 39.091 |
| 2.6666666666666665 | 39.236 |
| 2.1333333333333333 | 39.32 |
| 1.7777777777777777 | 39.355 |
| 5.333333333333333 | 38.792 |
| 3.5555555555555554 | 39.054 |
| 2.6666666666666665 | 39.205 |
| 2.1333333333333333 | 39.306 |
| 1.7777777777777777 | 39.353 |
| 5.333333333333333 | 38.748 |
| 3.5555555555555554 | 39.008 |
| 2.6666666666666665 | 39.174 |
| 2.1333333333333333 | 39.29 |
| 1.7777777777777777 | 39.348 |
| 6.0 | 39.081 |
| 4.0 | 39.094 |
| 3.0 | 39.121 |
| 2.4 | 39.138 |
| 2.0 | 39.117 |
| 6.0 | 39.076 |
| 4.0 | 39.174 |
| 3.0 | 39.209 |
| 2.4 | 39.237 |
| 2.0 | 39.235 |
| 6.0 | 39.035 |
| 4.0 | 39.168 |
| 3.0 | 39.232 |
| 2.4 | 39.297 |
| 2.0 | 39.289 |
| 6.0 | 38.971 |
| 4.0 | 39.156 |
| 3.0 | 39.246 |
| 2.4 | 39.305 |
| 2.0 | 39.339 |
| 6.0 | 38.904 |
| 4.0 | 39.115 |
| 3.0 | 39.234 |
| 2.4 | 39.318 |
| 2.0 | 39.348 |
| 6.0 | 38.836 |
| 4.0 | 39.076 |
| 3.0 | 39.219 |
| 2.4 | 39.31 |
| 2.0 | 39.352 |
| 6.0 | 38.78 |
| 4.0 | 39.042 |
| 3.0 | 39.186 |
| 2.4 | 39.294 |
| 2.0 | 39.349 |
| 6.0 | 38.737 |
| 4.0 | 38.991 |
| 3.0 | 39.158 |
| 2.4 | 39.277 |
| 2.0 | 39.336 |
| 1.3333333333333333 | 38.992 |
| 0.8888888888888888 | 39.001 |
| 0.6666666666666666 | 38.974 |
| 0.5333333333333333 | 38.928 |
| 0.4444444444444444 | 38.875 |
| 1.3333333333333333 | 38.978 |
| 0.8888888888888888 | 39.044 |
| 0.6666666666666666 | 39.046 |
| 0.5333333333333333 | 39.014 |
| 0.4444444444444444 | 38.985 |
| 1.3333333333333333 | 38.931 |
| 0.8888888888888888 | 39.043 |
| 0.6666666666666666 | 39.07 |
| 0.5333333333333333 | 39.057 |
| 0.4444444444444444 | 39.045 |
| 1.3333333333333333 | 38.875 |
| 0.8888888888888888 | 39.024 |
| 0.6666666666666666 | 39.071 |
| 0.5333333333333333 | 39.088 |
| 0.4444444444444444 | 39.077 |
| 1.3333333333333333 | 38.854 |
| 0.8888888888888888 | 38.987 |
| 0.6666666666666666 | 39.043 |
| 0.5333333333333333 | 39.09 |
| 0.4444444444444444 | 39.091 |
| 1.3333333333333333 | 38.846 |
| 0.8888888888888888 | 38.946 |
| 0.6666666666666666 | 39.03 |
| 0.5333333333333333 | 39.072 |
| 0.4444444444444444 | 39.081 |
| 1.3333333333333333 | 38.802 |
| 0.8888888888888888 | 38.935 |
| 0.6666666666666666 | 39.004 |
| 0.5333333333333333 | 39.049 |
| 0.4444444444444444 | 39.065 |
| 1.3333333333333333 | 38.799 |
| 0.8888888888888888 | 38.913 |
| 0.6666666666666666 | 38.98 |
| 0.5333333333333333 | 39.028 |
| 0.4444444444444444 | 39.052 |
| 2.0 | 38.917 |
| 1.3333333333333333 | 38.982 |
| 1.0 | 38.979 |
| 0.8 | 38.95 |
| 0.6666666666666666 | 38.903 |
| 2.0 | 38.895 |
| 1.3333333333333333 | 39.016 |
| 1.0 | 39.046 |
| 0.8 | 39.046 |
| 0.6666666666666666 | 39.006 |
| 2.0 | 38.841 |
| 1.3333333333333333 | 39.005 |
| 1.0 | 39.064 |
| 0.8 | 39.086 |
| 0.6666666666666666 | 39.063 |
| 2.0 | 38.78 |
| 1.3333333333333333 | 38.987 |
| 1.0 | 39.063 |
| 0.8 | 39.116 |
| 0.6666666666666666 | 39.095 |
| 2.0 | 38.756 |
| 1.3333333333333333 | 38.948 |
| 1.0 | 39.036 |
| 0.8 | 39.116 |
| 0.6666666666666666 | 39.109 |
| 2.0 | 38.742 |
| 1.3333333333333333 | 38.9 |
| 1.0 | 39.022 |
| 0.8 | 39.097 |
| 0.6666666666666666 | 39.097 |
| 2.0 | 38.699 |
| 1.3333333333333333 | 38.891 |
| 1.0 | 38.994 |
| 0.8 | 39.072 |
| 0.6666666666666666 | 39.081 |
| 2.0 | 38.694 |
| 1.3333333333333333 | 38.867 |
| 1.0 | 38.969 |
| 0.8 | 39.048 |
| 0.6666666666666666 | 39.067 |
| 2.6666666666666665 | 38.873 |
| 1.7777777777777777 | 38.933 |
| 1.3333333333333333 | 38.956 |
| 1.0666666666666667 | 38.95 |
| 0.8888888888888888 | 38.918 |
| 2.6666666666666665 | 38.84 |
| 1.7777777777777777 | 38.957 |
| 1.3333333333333333 | 39.019 |
| 1.0666666666666667 | 39.043 |
| 0.8888888888888888 | 39.017 |
| 2.6666666666666665 | 38.78 |
| 1.7777777777777777 | 38.956 |
| 1.3333333333333333 | 39.044 |
| 1.0666666666666667 | 39.08 |
| 0.8888888888888888 | 39.077 |
| 2.6666666666666665 | 38.715 |
| 1.7777777777777777 | 38.935 |
| 1.3333333333333333 | 39.039 |
| 1.0666666666666667 | 39.108 |
| 0.8888888888888888 | 39.106 |
| 2.6666666666666665 | 38.689 |
| 1.7777777777777777 | 38.894 |
| 1.3333333333333333 | 39.011 |
| 1.0666666666666667 | 39.107 |
| 0.8888888888888888 | 39.119 |
| 2.6666666666666665 | 38.669 |
| 1.7777777777777777 | 38.844 |
| 1.3333333333333333 | 38.995 |
| 1.0666666666666667 | 39.083 |
| 0.8888888888888888 | 39.107 |
| 2.6666666666666665 | 38.627 |
| 1.7777777777777777 | 38.833 |
| 1.3333333333333333 | 38.966 |
| 1.0666666666666667 | 39.056 |
| 0.8888888888888888 | 39.09 |
| 2.6666666666666665 | 38.621 |
| 1.7777777777777777 | 38.808 |
| 1.3333333333333333 | 38.94 |
| 1.0666666666666667 | 39.036 |
| 0.8888888888888888 | 39.075 |
| 3.3333333333333335 | 38.826 |
| 2.2222222222222223 | 38.922 |
| 1.6666666666666667 | 38.925 |
| 1.3333333333333333 | 38.952 |
| 1.1111111111111112 | 38.914 |
| 3.3333333333333335 | 38.784 |
| 2.2222222222222223 | 38.937 |
| 1.6666666666666667 | 38.984 |
| 1.3333333333333333 | 39.04 |
| 1.1111111111111112 | 39.011 |
| 3.3333333333333335 | 38.718 |
| 2.2222222222222223 | 38.93 |
| 1.6666666666666667 | 39.005 |
| 1.3333333333333333 | 39.075 |
| 1.1111111111111112 | 39.069 |
| 3.3333333333333335 | 38.662 |
| 2.2222222222222223 | 38.893 |
| 1.6666666666666667 | 38.997 |
| 1.3333333333333333 | 39.085 |
| 1.1111111111111112 | 39.096 |
| 3.3333333333333335 | 38.633 |
| 2.2222222222222223 | 38.849 |
| 1.6666666666666667 | 38.967 |
| 1.3333333333333333 | 39.078 |
| 1.1111111111111112 | 39.107 |
| 3.3333333333333335 | 38.61 |
| 2.2222222222222223 | 38.798 |
| 1.6666666666666667 | 38.946 |
| 1.3333333333333333 | 39.056 |
| 1.1111111111111112 | 39.094 |
| 3.3333333333333335 | 38.566 |
| 2.2222222222222223 | 38.784 |
| 1.6666666666666667 | 38.92 |
| 1.3333333333333333 | 39.029 |
| 1.1111111111111112 | 39.076 |
| 3.3333333333333335 | 38.558 |
| 2.2222222222222223 | 38.758 |
| 1.6666666666666667 | 38.893 |
| 1.3333333333333333 | 39.008 |
| 1.1111111111111112 | 39.061 |
| 4.0 | 38.797 |
| 2.6666666666666665 | 38.9 |
| 2.0 | 38.896 |
| 1.6 | 38.933 |
| 1.3333333333333333 | 38.911 |
| 4.0 | 38.752 |
| 2.6666666666666665 | 38.909 |
| 2.0 | 38.949 |
| 1.6 | 39.017 |
| 1.3333333333333333 | 39.005 |
| 4.0 | 38.681 |
| 2.6666666666666665 | 38.897 |
| 2.0 | 38.967 |
| 1.6 | 39.046 |
| 1.3333333333333333 | 39.062 |
| 4.0 | 38.62 |
| 2.6666666666666665 | 38.857 |
| 2.0 | 38.956 |
| 1.6 | 39.054 |
| 1.3333333333333333 | 39.087 |
| 4.0 | 38.584 |
| 2.6666666666666665 | 38.81 |
| 2.0 | 38.919 |
| 1.6 | 39.049 |
| 1.3333333333333333 | 39.091 |
| 4.0 | 38.558 |
| 2.6666666666666665 | 38.758 |
| 2.0 | 38.9 |
| 1.6 | 39.025 |
| 1.3333333333333333 | 39.076 |
| 4.0 | 38.514 |
| 2.6666666666666665 | 38.743 |
| 2.0 | 38.873 |
| 1.6 | 38.997 |
| 1.3333333333333333 | 39.057 |
| 4.0 | 38.504 |
| 2.6666666666666665 | 38.717 |
| 2.0 | 38.845 |
| 1.6 | 38.975 |
| 1.3333333333333333 | 39.042 |
| 4.666666666666667 | 38.814 |
| 3.111111111111111 | 38.859 |
| 2.3333333333333335 | 38.891 |
| 1.8666666666666667 | 38.905 |
| 1.5555555555555556 | 38.885 |
| 4.666666666666667 | 38.764 |
| 3.111111111111111 | 38.866 |
| 2.3333333333333335 | 38.94 |
| 1.8666666666666667 | 38.983 |
| 1.5555555555555556 | 38.976 |
| 4.666666666666667 | 38.692 |
| 3.111111111111111 | 38.851 |
| 2.3333333333333335 | 38.953 |
| 1.8666666666666667 | 39.01 |
| 1.5555555555555556 | 39.03 |
| 4.666666666666667 | 38.626 |
| 3.111111111111111 | 38.809 |
| 2.3333333333333335 | 38.94 |
| 1.8666666666666667 | 39.015 |
| 1.5555555555555556 | 39.053 |
| 4.666666666666667 | 38.589 |
| 3.111111111111111 | 38.762 |
| 2.3333333333333335 | 38.902 |
| 1.8666666666666667 | 39.008 |
| 1.5555555555555556 | 39.056 |
| 4.666666666666667 | 38.548 |
| 3.111111111111111 | 38.717 |
| 2.3333333333333335 | 38.881 |
| 1.8666666666666667 | 38.984 |
| 1.5555555555555556 | 39.049 |
| 4.666666666666667 | 38.503 |
| 3.111111111111111 | 38.7 |
| 2.3333333333333335 | 38.852 |
| 1.8666666666666667 | 38.954 |
| 1.5555555555555556 | 39.024 |
| 4.666666666666667 | 38.492 |
| 3.111111111111111 | 38.673 |
| 2.3333333333333335 | 38.823 |
| 1.8666666666666667 | 38.93 |
| 1.5555555555555556 | 39.008 |
| 5.333333333333333 | 38.796 |
| 3.5555555555555554 | 38.856 |
| 2.6666666666666665 | 38.885 |
| 2.1333333333333333 | 38.888 |
| 1.7777777777777777 | 38.86 |
| 5.333333333333333 | 38.748 |
| 3.5555555555555554 | 38.863 |
| 2.6666666666666665 | 38.931 |
| 2.1333333333333333 | 38.963 |
| 1.7777777777777777 | 38.946 |
| 5.333333333333333 | 38.674 |
| 3.5555555555555554 | 38.845 |
| 2.6666666666666665 | 38.94 |
| 2.1333333333333333 | 38.992 |
| 1.7777777777777777 | 38.999 |
| 5.333333333333333 | 38.608 |
| 3.5555555555555554 | 38.799 |
| 2.6666666666666665 | 38.922 |
| 2.1333333333333333 | 38.992 |
| 1.7777777777777777 | 39.02 |
| 5.333333333333333 | 38.569 |
| 3.5555555555555554 | 38.748 |
| 2.6666666666666665 | 38.886 |
| 2.1333333333333333 | 38.984 |
| 1.7777777777777777 | 39.022 |
| 5.333333333333333 | 38.526 |
| 3.5555555555555554 | 38.701 |
| 2.6666666666666665 | 38.862 |
| 2.1333333333333333 | 38.959 |
| 1.7777777777777777 | 39.01 |
| 5.333333333333333 | 38.489 |
| 3.5555555555555554 | 38.668 |
| 2.6666666666666665 | 38.821 |
| 2.1333333333333333 | 38.941 |
| 1.7777777777777777 | 38.987 |
| 5.333333333333333 | 38.477 |
| 3.5555555555555554 | 38.64 |
| 2.6666666666666665 | 38.791 |
| 2.1333333333333333 | 38.917 |
| 1.7777777777777777 | 38.97 |
| 6.0 | 38.802 |
| 4.0 | 38.835 |
| 3.0 | 38.87 |
| 2.4 | 38.886 |
| 2.0 | 38.854 |
| 6.0 | 38.752 |
| 4.0 | 38.84 |
| 3.0 | 38.912 |
| 2.4 | 38.958 |
| 2.0 | 38.939 |
| 6.0 | 38.676 |
| 4.0 | 38.819 |
| 3.0 | 38.919 |
| 2.4 | 38.985 |
| 2.0 | 38.989 |
| 6.0 | 38.608 |
| 4.0 | 38.771 |
| 3.0 | 38.899 |
| 2.4 | 38.98 |
| 2.0 | 39.009 |
| 6.0 | 38.567 |
| 4.0 | 38.718 |
| 3.0 | 38.862 |
| 2.4 | 38.97 |
| 2.0 | 39.01 |
| 6.0 | 38.523 |
| 4.0 | 38.669 |
| 3.0 | 38.837 |
| 2.4 | 38.943 |
| 2.0 | 38.997 |
| 6.0 | 38.485 |
| 4.0 | 38.635 |
| 3.0 | 38.795 |
| 2.4 | 38.924 |
| 2.0 | 38.972 |
| 6.0 | 38.462 |
| 4.0 | 38.606 |
| 3.0 | 38.764 |
| 2.4 | 38.886 |
| 2.0 | 38.948 |
| 1.3333333333333333 | 38.864 |
| 0.8888888888888888 | 38.869 |
| 0.6666666666666666 | 38.888 |
| 0.5333333333333333 | 38.839 |
| 0.4444444444444444 | 38.791 |
| 1.3333333333333333 | 38.866 |
| 0.8888888888888888 | 38.942 |
| 0.6666666666666666 | 38.966 |
| 0.5333333333333333 | 38.949 |
| 0.4444444444444444 | 38.906 |
| 1.3333333333333333 | 38.858 |
| 0.8888888888888888 | 38.934 |
| 0.6666666666666666 | 38.977 |
| 0.5333333333333333 | 38.997 |
| 0.4444444444444444 | 38.952 |
| 1.3333333333333333 | 38.847 |
| 0.8888888888888888 | 38.939 |
| 0.6666666666666666 | 38.987 |
| 0.5333333333333333 | 38.987 |
| 0.4444444444444444 | 38.99 |
| 1.3333333333333333 | 38.824 |
| 0.8888888888888888 | 38.908 |
| 0.6666666666666666 | 38.976 |
| 0.5333333333333333 | 38.997 |
| 0.4444444444444444 | 38.986 |
| 1.3333333333333333 | 38.801 |
| 0.8888888888888888 | 38.904 |
| 0.6666666666666666 | 38.972 |
| 0.5333333333333333 | 38.983 |
| 0.4444444444444444 | 38.981 |
| 1.3333333333333333 | 38.805 |
| 0.8888888888888888 | 38.901 |
| 0.6666666666666666 | 38.947 |
| 0.5333333333333333 | 38.976 |
| 0.4444444444444444 | 38.972 |
| 1.3333333333333333 | 38.804 |
| 0.8888888888888888 | 38.882 |
| 0.6666666666666666 | 38.944 |
| 0.5333333333333333 | 38.962 |
| 0.4444444444444444 | 38.963 |
| 2.0 | 38.766 |
| 1.3333333333333333 | 38.823 |
| 1.0 | 38.866 |
| 0.8 | 38.845 |
| 0.6666666666666666 | 38.819 |
| 2.0 | 38.754 |
| 1.3333333333333333 | 38.884 |
| 1.0 | 38.938 |
| 0.8 | 38.942 |
| 0.6666666666666666 | 38.932 |
| 2.0 | 38.738 |
| 1.3333333333333333 | 38.87 |
| 1.0 | 38.941 |
| 0.8 | 38.99 |
| 0.6666666666666666 | 38.975 |
| 2.0 | 38.721 |
| 1.3333333333333333 | 38.874 |
| 1.0 | 38.951 |
| 0.8 | 38.978 |
| 0.6666666666666666 | 39.008 |
| 2.0 | 38.692 |
| 1.3333333333333333 | 38.838 |
| 1.0 | 38.937 |
| 0.8 | 38.985 |
| 0.6666666666666666 | 39.002 |
| 2.0 | 38.667 |
| 1.3333333333333333 | 38.833 |
| 1.0 | 38.932 |
| 0.8 | 38.969 |
| 0.6666666666666666 | 39 |
| 2.0 | 38.673 |
| 1.3333333333333333 | 38.826 |
| 1.0 | 38.904 |
| 0.8 | 38.959 |
| 0.6666666666666666 | 38.99 |
| 2.0 | 38.668 |
| 1.3333333333333333 | 38.805 |
| 1.0 | 38.9 |
| 0.8 | 38.943 |
| 0.6666666666666666 | 38.978 |
| 2.6666666666666665 | 38.714 |
| 1.7777777777777777 | 38.764 |
| 1.3333333333333333 | 38.798 |
| 1.0666666666666667 | 38.827 |
| 0.8888888888888888 | 38.794 |
| 2.6666666666666665 | 38.684 |
| 1.7777777777777777 | 38.813 |
| 1.3333333333333333 | 38.859 |
| 1.0666666666666667 | 38.919 |
| 0.8888888888888888 | 38.903 |
| 2.6666666666666665 | 38.654 |
| 1.7777777777777777 | 38.793 |
| 1.3333333333333333 | 38.862 |
| 1.0666666666666667 | 38.963 |
| 0.8888888888888888 | 38.945 |
| 2.6666666666666665 | 38.631 |
| 1.7777777777777777 | 38.793 |
| 1.3333333333333333 | 38.867 |
| 1.0666666666666667 | 38.949 |
| 0.8888888888888888 | 38.979 |
| 2.6666666666666665 | 38.603 |
| 1.7777777777777777 | 38.754 |
| 1.3333333333333333 | 38.851 |
| 1.0666666666666667 | 38.951 |
| 0.8888888888888888 | 38.972 |
| 2.6666666666666665 | 38.573 |
| 1.7777777777777777 | 38.745 |
| 1.3333333333333333 | 38.842 |
| 1.0666666666666667 | 38.936 |
| 0.8888888888888888 | 38.968 |
| 2.6666666666666665 | 38.576 |
| 1.7777777777777777 | 38.738 |
| 1.3333333333333333 | 38.811 |
| 1.0666666666666667 | 38.925 |
| 0.8888888888888888 | 38.956 |
| 2.6666666666666665 | 38.574 |
| 1.7777777777777777 | 38.714 |
| 1.3333333333333333 | 38.807 |
| 1.0666666666666667 | 38.906 |
| 0.8888888888888888 | 38.944 |
| 3.3333333333333335 | 38.699 |
| 2.2222222222222223 | 38.73 |
| 1.6666666666666667 | 38.771 |
| 1.3333333333333333 | 38.764 |
| 1.1111111111111112 | 38.775 |
| 3.3333333333333335 | 38.656 |
| 2.2222222222222223 | 38.769 |
| 1.6666666666666667 | 38.828 |
| 1.3333333333333333 | 38.851 |
| 1.1111111111111112 | 38.88 |
| 3.3333333333333335 | 38.615 |
| 2.2222222222222223 | 38.741 |
| 1.6666666666666667 | 38.824 |
| 1.3333333333333333 | 38.892 |
| 1.1111111111111112 | 38.919 |
| 3.3333333333333335 | 38.583 |
| 2.2222222222222223 | 38.734 |
| 1.6666666666666667 | 38.827 |
| 1.3333333333333333 | 38.874 |
| 1.1111111111111112 | 38.95 |
| 3.3333333333333335 | 38.554 |
| 2.2222222222222223 | 38.692 |
| 1.6666666666666667 | 38.808 |
| 1.3333333333333333 | 38.877 |
| 1.1111111111111112 | 38.941 |
| 3.3333333333333335 | 38.518 |
| 2.2222222222222223 | 38.682 |
| 1.6666666666666667 | 38.799 |
| 1.3333333333333333 | 38.861 |
| 1.1111111111111112 | 38.937 |
| 3.3333333333333335 | 38.523 |
| 2.2222222222222223 | 38.672 |
| 1.6666666666666667 | 38.765 |
| 1.3333333333333333 | 38.848 |
| 1.1111111111111112 | 38.924 |
| 3.3333333333333335 | 38.522 |
| 2.2222222222222223 | 38.648 |
| 1.6666666666666667 | 38.761 |
| 1.3333333333333333 | 38.828 |
| 1.1111111111111112 | 38.911 |
| 4.0 | 38.672 |
| 2.6666666666666665 | 38.694 |
| 2.0 | 38.74 |
| 1.6 | 38.752 |
| 1.3333333333333333 | 38.732 |
| 4.0 | 38.625 |
| 2.6666666666666665 | 38.723 |
| 2.0 | 38.788 |
| 1.6 | 38.83 |
| 1.3333333333333333 | 38.832 |
| 4.0 | 38.576 |
| 2.6666666666666665 | 38.687 |
| 2.0 | 38.778 |
| 1.6 | 38.863 |
| 1.3333333333333333 | 38.868 |
| 4.0 | 38.544 |
| 2.6666666666666665 | 38.674 |
| 2.0 | 38.777 |
| 1.6 | 38.846 |
| 1.3333333333333333 | 38.897 |
| 4.0 | 38.512 |
| 2.6666666666666665 | 38.629 |
| 2.0 | 38.755 |
| 1.6 | 38.847 |
| 1.3333333333333333 | 38.887 |
| 4.0 | 38.476 |
| 2.6666666666666665 | 38.616 |
| 2.0 | 38.741 |
| 1.6 | 38.829 |
| 1.3333333333333333 | 38.88 |
| 4.0 | 38.478 |
| 2.6666666666666665 | 38.605 |
| 2.0 | 38.71 |
| 1.6 | 38.815 |
| 1.3333333333333333 | 38.866 |
| 4.0 | 38.476 |
| 2.6666666666666665 | 38.578 |
| 2.0 | 38.7 |
| 1.6 | 38.794 |
| 1.3333333333333333 | 38.852 |
| 4.666666666666667 | 38.656 |
| 3.111111111111111 | 38.692 |
| 2.3333333333333335 | 38.714 |
| 1.8666666666666667 | 38.732 |
| 1.5555555555555556 | 38.714 |
| 4.666666666666667 | 38.607 |
| 3.111111111111111 | 38.717 |
| 2.3333333333333335 | 38.758 |
| 1.8666666666666667 | 38.803 |
| 1.5555555555555556 | 38.806 |
| 4.666666666666667 | 38.555 |
| 3.111111111111111 | 38.675 |
| 2.3333333333333335 | 38.744 |
| 1.8666666666666667 | 38.834 |
| 1.5555555555555556 | 38.838 |
| 4.666666666666667 | 38.519 |
| 3.111111111111111 | 38.656 |
| 2.3333333333333335 | 38.736 |
| 1.8666666666666667 | 38.814 |
| 1.5555555555555556 | 38.865 |
| 4.666666666666667 | 38.48 |
| 3.111111111111111 | 38.607 |
| 2.3333333333333335 | 38.714 |
| 1.8666666666666667 | 38.814 |
| 1.5555555555555556 | 38.852 |
| 4.666666666666667 | 38.444 |
| 3.111111111111111 | 38.59 |
| 2.3333333333333335 | 38.698 |
| 1.8666666666666667 | 38.79 |
| 1.5555555555555556 | 38.845 |
| 4.666666666666667 | 38.446 |
| 3.111111111111111 | 38.576 |
| 2.3333333333333335 | 38.662 |
| 1.8666666666666667 | 38.774 |
| 1.5555555555555556 | 38.83 |
| 4.666666666666667 | 38.443 |
| 3.111111111111111 | 38.549 |
| 2.3333333333333335 | 38.655 |
| 1.8666666666666667 | 38.752 |
| 1.5555555555555556 | 38.815 |
| 5.333333333333333 | 38.647 |
| 3.5555555555555554 | 38.686 |
| 2.6666666666666665 | 38.697 |
| 2.1333333333333333 | 38.711 |
| 1.7777777777777777 | 38.702 |
| 5.333333333333333 | 38.595 |
| 3.5555555555555554 | 38.71 |
| 2.6666666666666665 | 38.733 |
| 2.1333333333333333 | 38.775 |
| 1.7777777777777777 | 38.791 |
| 5.333333333333333 | 38.538 |
| 3.5555555555555554 | 38.665 |
| 2.6666666666666665 | 38.711 |
| 2.1333333333333333 | 38.801 |
| 1.7777777777777777 | 38.817 |
| 5.333333333333333 | 38.499 |
| 3.5555555555555554 | 38.642 |
| 2.6666666666666665 | 38.701 |
| 2.1333333333333333 | 38.776 |
| 1.7777777777777777 | 38.841 |
| 5.333333333333333 | 38.461 |
| 3.5555555555555554 | 38.589 |
| 2.6666666666666665 | 38.673 |
| 2.1333333333333333 | 38.773 |
| 1.7777777777777777 | 38.827 |
| 5.333333333333333 | 38.423 |
| 3.5555555555555554 | 38.569 |
| 2.6666666666666665 | 38.654 |
| 2.1333333333333333 | 38.748 |
| 1.7777777777777777 | 38.818 |
| 5.333333333333333 | 38.414 |
| 3.5555555555555554 | 38.555 |
| 2.6666666666666665 | 38.616 |
| 2.1333333333333333 | 38.729 |
| 1.7777777777777777 | 38.801 |
| 5.333333333333333 | 38.41 |
| 3.5555555555555554 | 38.526 |
| 2.6666666666666665 | 38.607 |
| 2.1333333333333333 | 38.706 |
| 1.7777777777777777 | 38.786 |
| 6.0 | 38.624 |
| 4.0 | 38.67 |
| 3.0 | 38.688 |
| 2.4 | 38.682 |
| 2.0 | 38.687 |
| 6.0 | 38.569 |
| 4.0 | 38.691 |
| 3.0 | 38.728 |
| 2.4 | 38.743 |
| 2.0 | 38.771 |
| 6.0 | 38.513 |
| 4.0 | 38.645 |
| 3.0 | 38.705 |
| 2.4 | 38.767 |
| 2.0 | 38.795 |
| 6.0 | 38.475 |
| 4.0 | 38.62 |
| 3.0 | 38.69 |
| 2.4 | 38.741 |
| 2.0 | 38.814 |
| 6.0 | 38.436 |
| 4.0 | 38.565 |
| 3.0 | 38.661 |
| 2.4 | 38.734 |
| 2.0 | 38.798 |
| 6.0 | 38.396 |
| 4.0 | 38.542 |
| 3.0 | 38.64 |
| 2.4 | 38.708 |
| 2.0 | 38.787 |
| 6.0 | 38.384 |
| 4.0 | 38.526 |
| 3.0 | 38.6 |
| 2.4 | 38.688 |
| 2.0 | 38.77 |
| 6.0 | 38.387 |
| 4.0 | 38.496 |
| 3.0 | 38.591 |
| 2.4 | 38.668 |
| 2.0 | 38.749 |
| 1.3333333333333333 | 38.813 |
| 0.8888888888888888 | 38.804 |
| 0.6666666666666666 | 38.792 |
| 0.5333333333333333 | 38.803 |
| 0.4444444444444444 | 38.747 |
| 1.3333333333333333 | 38.818 |
| 0.8888888888888888 | 38.887 |
| 0.6666666666666666 | 38.875 |
| 0.5333333333333333 | 38.878 |
| 0.4444444444444444 | 38.848 |
| 1.3333333333333333 | 38.816 |
| 0.8888888888888888 | 38.886 |
| 0.6666666666666666 | 38.903 |
| 0.5333333333333333 | 38.92 |
| 0.4444444444444444 | 38.896 |
| 1.3333333333333333 | 38.818 |
| 0.8888888888888888 | 38.875 |
| 0.6666666666666666 | 38.902 |
| 0.5333333333333333 | 38.931 |
| 0.4444444444444444 | 38.92 |
| 1.3333333333333333 | 38.768 |
| 0.8888888888888888 | 38.864 |
| 0.6666666666666666 | 38.895 |
| 0.5333333333333333 | 38.934 |
| 0.4444444444444444 | 38.924 |
| 1.3333333333333333 | 38.783 |
| 0.8888888888888888 | 38.88 |
| 0.6666666666666666 | 38.881 |
| 0.5333333333333333 | 38.931 |
| 0.4444444444444444 | 38.922 |
| 1.3333333333333333 | 38.786 |
| 0.8888888888888888 | 38.875 |
| 0.6666666666666666 | 38.889 |
| 0.5333333333333333 | 38.934 |
| 0.4444444444444444 | 38.924 |
| 1.3333333333333333 | 38.762 |
| 0.8888888888888888 | 38.849 |
| 0.6666666666666666 | 38.891 |
| 0.5333333333333333 | 38.924 |
| 0.4444444444444444 | 38.913 |
| 2.0 | 38.668 |
| 1.3333333333333333 | 38.742 |
| 1.0 | 38.742 |
| 0.8 | 38.762 |
| 0.6666666666666666 | 38.74 |
| 2.0 | 38.653 |
| 1.3333333333333333 | 38.805 |
| 1.0 | 38.818 |
| 0.8 | 38.833 |
| 0.6666666666666666 | 38.841 |
| 2.0 | 38.642 |
| 1.3333333333333333 | 38.802 |
| 1.0 | 38.842 |
| 0.8 | 38.876 |
| 0.6666666666666666 | 38.887 |
| 2.0 | 38.638 |
| 1.3333333333333333 | 38.786 |
| 1.0 | 38.841 |
| 0.8 | 38.884 |
| 0.6666666666666666 | 38.904 |
| 2.0 | 38.584 |
| 1.3333333333333333 | 38.77 |
| 1.0 | 38.83 |
| 0.8 | 38.882 |
| 0.6666666666666666 | 38.907 |
| 2.0 | 38.594 |
| 1.3333333333333333 | 38.783 |
| 1.0 | 38.814 |
| 0.8 | 38.876 |
| 0.6666666666666666 | 38.905 |
| 2.0 | 38.597 |
| 1.3333333333333333 | 38.777 |
| 1.0 | 38.819 |
| 0.8 | 38.878 |
| 0.6666666666666666 | 38.905 |
| 2.0 | 38.574 |
| 1.3333333333333333 | 38.75 |
| 1.0 | 38.82 |
| 0.8 | 38.865 |
| 0.6666666666666666 | 38.894 |
| 2.6666666666666665 | 38.645 |
| 1.7777777777777777 | 38.657 |
| 1.3333333333333333 | 38.679 |
| 1.0666666666666667 | 38.712 |
| 0.8888888888888888 | 38.702 |
| 2.6666666666666665 | 38.609 |
| 1.7777777777777777 | 38.709 |
| 1.3333333333333333 | 38.747 |
| 1.0666666666666667 | 38.777 |
| 0.8888888888888888 | 38.8 |
| 2.6666666666666665 | 38.586 |
| 1.7777777777777777 | 38.696 |
| 1.3333333333333333 | 38.766 |
| 1.0666666666666667 | 38.816 |
| 0.8888888888888888 | 38.838 |
| 2.6666666666666665 | 38.577 |
| 1.7777777777777777 | 38.674 |
| 1.3333333333333333 | 38.761 |
| 1.0666666666666667 | 38.821 |
| 0.8888888888888888 | 38.857 |
| 2.6666666666666665 | 38.519 |
| 1.7777777777777777 | 38.655 |
| 1.3333333333333333 | 38.747 |
| 1.0666666666666667 | 38.817 |
| 0.8888888888888888 | 38.858 |
| 2.6666666666666665 | 38.526 |
| 1.7777777777777777 | 38.664 |
| 1.3333333333333333 | 38.727 |
| 1.0666666666666667 | 38.808 |
| 0.8888888888888888 | 38.855 |
| 2.6666666666666665 | 38.528 |
| 1.7777777777777777 | 38.656 |
| 1.3333333333333333 | 38.73 |
| 1.0666666666666667 | 38.806 |
| 0.8888888888888888 | 38.852 |
| 2.6666666666666665 | 38.504 |
| 1.7777777777777777 | 38.627 |
| 1.3333333333333333 | 38.729 |
| 1.0666666666666667 | 38.792 |
| 0.8888888888888888 | 38.838 |
| 3.3333333333333335 | 38.627 |
| 2.2222222222222223 | 38.623 |
| 1.6666666666666667 | 38.628 |
| 1.3333333333333333 | 38.663 |
| 1.1111111111111112 | 38.652 |
| 3.3333333333333335 | 38.58 |
| 2.2222222222222223 | 38.657 |
| 1.6666666666666667 | 38.686 |
| 1.3333333333333333 | 38.725 |
| 1.1111111111111112 | 38.744 |
| 3.3333333333333335 | 38.544 |
| 2.2222222222222223 | 38.634 |
| 1.6666666666666667 | 38.698 |
| 1.3333333333333333 | 38.759 |
| 1.1111111111111112 | 38.779 |
| 3.3333333333333335 | 38.528 |
| 2.2222222222222223 | 38.604 |
| 1.6666666666666667 | 38.686 |
| 1.3333333333333333 | 38.762 |
| 1.1111111111111112 | 38.796 |
| 3.3333333333333335 | 38.468 |
| 2.2222222222222223 | 38.582 |
| 1.6666666666666667 | 38.669 |
| 1.3333333333333333 | 38.755 |
| 1.1111111111111112 | 38.795 |
| 3.3333333333333335 | 38.473 |
| 2.2222222222222223 | 38.588 |
| 1.6666666666666667 | 38.646 |
| 1.3333333333333333 | 38.744 |
| 1.1111111111111112 | 38.79 |
| 3.3333333333333335 | 38.474 |
| 2.2222222222222223 | 38.577 |
| 1.6666666666666667 | 38.647 |
| 1.3333333333333333 | 38.74 |
| 1.1111111111111112 | 38.787 |
| 3.3333333333333335 | 38.45 |
| 2.2222222222222223 | 38.544 |
| 1.6666666666666667 | 38.641 |
| 1.3333333333333333 | 38.721 |
| 1.1111111111111112 | 38.767 |
| 4.0 | 38.566 |
| 2.6666666666666665 | 38.604 |
| 2.0 | 38.584 |
| 1.6 | 38.632 |
| 1.3333333333333333 | 38.623 |
| 4.0 | 38.513 |
| 2.6666666666666665 | 38.628 |
| 2.0 | 38.631 |
| 1.6 | 38.681 |
| 1.3333333333333333 | 38.702 |
| 4.0 | 38.47 |
| 2.6666666666666665 | 38.595 |
| 2.0 | 38.634 |
| 1.6 | 38.709 |
| 1.3333333333333333 | 38.737 |
| 4.0 | 38.447 |
| 2.6666666666666665 | 38.56 |
| 2.0 | 38.617 |
| 1.6 | 38.709 |
| 1.3333333333333333 | 38.752 |
| 4.0 | 38.416 |
| 2.6666666666666665 | 38.543 |
| 2.0 | 38.597 |
| 1.6 | 38.7 |
| 1.3333333333333333 | 38.75 |
| 4.0 | 38.417 |
| 2.6666666666666665 | 38.546 |
| 2.0 | 38.572 |
| 1.6 | 38.687 |
| 1.3333333333333333 | 38.743 |
| 4.0 | 38.421 |
| 2.6666666666666665 | 38.534 |
| 2.0 | 38.572 |
| 1.6 | 38.681 |
| 1.3333333333333333 | 38.738 |
| 4.0 | 38.397 |
| 2.6666666666666665 | 38.5 |
| 2.0 | 38.565 |
| 1.6 | 38.66 |
| 1.3333333333333333 | 38.718 |
| 4.666666666666667 | 38.585 |
| 3.111111111111111 | 38.604 |
| 2.3333333333333335 | 38.584 |
| 1.8666666666666667 | 38.599 |
| 1.5555555555555556 | 38.599 |
| 4.666666666666667 | 38.529 |
| 3.111111111111111 | 38.626 |
| 2.3333333333333335 | 38.623 |
| 1.8666666666666667 | 38.641 |
| 1.5555555555555556 | 38.674 |
| 4.666666666666667 | 38.482 |
| 3.111111111111111 | 38.587 |
| 2.3333333333333335 | 38.619 |
| 1.8666666666666667 | 38.66 |
| 1.5555555555555556 | 38.703 |
| 4.666666666666667 | 38.456 |
| 3.111111111111111 | 38.545 |
| 2.3333333333333335 | 38.596 |
| 1.8666666666666667 | 38.655 |
| 1.5555555555555556 | 38.714 |
| 4.666666666666667 | 38.42 |
| 3.111111111111111 | 38.524 |
| 2.3333333333333335 | 38.575 |
| 1.8666666666666667 | 38.644 |
| 1.5555555555555556 | 38.709 |
| 4.666666666666667 | 38.39 |
| 3.111111111111111 | 38.516 |
| 2.3333333333333335 | 38.552 |
| 1.8666666666666667 | 38.626 |
| 1.5555555555555556 | 38.695 |
| 4.666666666666667 | 38.391 |
| 3.111111111111111 | 38.502 |
| 2.3333333333333335 | 38.55 |
| 1.8666666666666667 | 38.618 |
| 1.5555555555555556 | 38.69 |
| 4.666666666666667 | 38.366 |
| 3.111111111111111 | 38.467 |
| 2.3333333333333335 | 38.542 |
| 1.8666666666666667 | 38.596 |
| 1.5555555555555556 | 38.669 |
| 5.333333333333333 | 38.589 |
| 3.5555555555555554 | 38.591 |
| 2.6666666666666665 | 38.578 |
| 2.1333333333333333 | 38.594 |
| 1.7777777777777777 | 38.575 |
| 5.333333333333333 | 38.533 |
| 3.5555555555555554 | 38.609 |
| 2.6666666666666665 | 38.615 |
| 2.1333333333333333 | 38.63 |
| 1.7777777777777777 | 38.644 |
| 5.333333333333333 | 38.485 |
| 3.5555555555555554 | 38.569 |
| 2.6666666666666665 | 38.606 |
| 2.1333333333333333 | 38.644 |
| 1.7777777777777777 | 38.667 |
| 5.333333333333333 | 38.457 |
| 3.5555555555555554 | 38.522 |
| 2.6666666666666665 | 38.578 |
| 2.1333333333333333 | 38.633 |
| 1.7777777777777777 | 38.675 |
| 5.333333333333333 | 38.422 |
| 3.5555555555555554 | 38.497 |
| 2.6666666666666665 | 38.554 |
| 2.1333333333333333 | 38.618 |
| 1.7777777777777777 | 38.668 |
| 5.333333333333333 | 38.389 |
| 3.5555555555555554 | 38.486 |
| 2.6666666666666665 | 38.528 |
| 2.1333333333333333 | 38.598 |
| 1.7777777777777777 | 38.652 |
| 5.333333333333333 | 38.388 |
| 3.5555555555555554 | 38.471 |
| 2.6666666666666665 | 38.525 |
| 2.1333333333333333 | 38.589 |
| 1.7777777777777777 | 38.647 |
| 5.333333333333333 | 38.363 |
| 3.5555555555555554 | 38.435 |
| 2.6666666666666665 | 38.515 |
| 2.1333333333333333 | 38.566 |
| 1.7777777777777777 | 38.625 |
| 6.0 | 38.564 |
| 4.0 | 38.561 |
| 3.0 | 38.572 |
| 2.4 | 38.594 |
| 2.0 | 38.547 |
| 6.0 | 38.508 |
| 4.0 | 38.576 |
| 3.0 | 38.606 |
| 2.4 | 38.628 |
| 2.0 | 38.611 |
| 6.0 | 38.462 |
| 4.0 | 38.532 |
| 3.0 | 38.596 |
| 2.4 | 38.637 |
| 2.0 | 38.63 |
| 6.0 | 38.432 |
| 4.0 | 38.481 |
| 3.0 | 38.561 |
| 2.4 | 38.62 |
| 2.0 | 38.63 |
| 6.0 | 38.397 |
| 4.0 | 38.453 |
| 3.0 | 38.534 |
| 2.4 | 38.6 |
| 2.0 | 38.618 |
| 6.0 | 38.362 |
| 4.0 | 38.44 |
| 3.0 | 38.504 |
| 2.4 | 38.578 |
| 2.0 | 38.601 |
| 6.0 | 38.36 |
| 4.0 | 38.423 |
| 3.0 | 38.499 |
| 2.4 | 38.568 |
| 2.0 | 38.594 |
| 6.0 | 38.364 |
| 4.0 | 38.394 |
| 3.0 | 38.488 |
| 2.4 | 38.539 |
| 2.0 | 38.571 |
| 1.3333333333333333 | 38.701 |
| 0.8888888888888888 | 38.731 |
| 0.6666666666666666 | 38.783 |
| 0.5333333333333333 | 38.739 |
| 0.4444444444444444 | 38.708 |
| 1.3333333333333333 | 38.73 |
| 0.8888888888888888 | 38.808 |
| 0.6666666666666666 | 38.859 |
| 0.5333333333333333 | 38.834 |
| 0.4444444444444444 | 38.819 |
| 1.3333333333333333 | 38.744 |
| 0.8888888888888888 | 38.825 |
| 0.6666666666666666 | 38.873 |
| 0.5333333333333333 | 38.887 |
| 0.4444444444444444 | 38.852 |
| 1.3333333333333333 | 38.74 |
| 0.8888888888888888 | 38.828 |
| 0.6666666666666666 | 38.907 |
| 0.5333333333333333 | 38.882 |
| 0.4444444444444444 | 38.893 |
| 1.3333333333333333 | 38.738 |
| 0.8888888888888888 | 38.83 |
| 0.6666666666666666 | 38.897 |
| 0.5333333333333333 | 38.905 |
| 0.4444444444444444 | 38.896 |
| 1.3333333333333333 | 38.711 |
| 0.8888888888888888 | 38.833 |
| 0.6666666666666666 | 38.898 |
| 0.5333333333333333 | 38.912 |
| 0.4444444444444444 | 38.906 |
| 1.3333333333333333 | 38.705 |
| 0.8888888888888888 | 38.833 |
| 0.6666666666666666 | 38.892 |
| 0.5333333333333333 | 38.898 |
| 0.4444444444444444 | 38.911 |
| 1.3333333333333333 | 38.728 |
| 0.8888888888888888 | 38.823 |
| 0.6666666666666666 | 38.897 |
| 0.5333333333333333 | 38.901 |
| 0.4444444444444444 | 38.904 |
| 2.0 | 38.567 |
| 1.3333333333333333 | 38.634 |
| 1.0 | 38.699 |
| 0.8 | 38.693 |
| 0.6666666666666666 | 38.691 |
| 2.0 | 38.576 |
| 1.3333333333333333 | 38.708 |
| 1.0 | 38.768 |
| 0.8 | 38.786 |
| 0.6666666666666666 | 38.796 |
| 2.0 | 38.579 |
| 1.3333333333333333 | 38.718 |
| 1.0 | 38.776 |
| 0.8 | 38.829 |
| 0.6666666666666666 | 38.825 |
| 2.0 | 38.569 |
| 1.3333333333333333 | 38.714 |
| 1.0 | 38.805 |
| 0.8 | 38.825 |
| 0.6666666666666666 | 38.864 |
| 2.0 | 38.564 |
| 1.3333333333333333 | 38.712 |
| 1.0 | 38.791 |
| 0.8 | 38.843 |
| 0.6666666666666666 | 38.863 |
| 2.0 | 38.532 |
| 1.3333333333333333 | 38.712 |
| 1.0 | 38.789 |
| 0.8 | 38.845 |
| 0.6666666666666666 | 38.871 |
| 2.0 | 38.525 |
| 1.3333333333333333 | 38.711 |
| 1.0 | 38.779 |
| 0.8 | 38.829 |
| 0.6666666666666666 | 38.873 |
| 2.0 | 38.549 |
| 1.3333333333333333 | 38.698 |
| 1.0 | 38.783 |
| 0.8 | 38.83 |
| 0.6666666666666666 | 38.865 |
| 2.6666666666666665 | 38.536 |
| 1.7777777777777777 | 38.54 |
| 1.3333333333333333 | 38.615 |
| 1.0666666666666667 | 38.626 |
| 0.8888888888888888 | 38.626 |
| 2.6666666666666665 | 38.52 |
| 1.7777777777777777 | 38.594 |
| 1.3333333333333333 | 38.679 |
| 1.0666666666666667 | 38.712 |
| 0.8888888888888888 | 38.723 |
| 2.6666666666666665 | 38.51 |
| 1.7777777777777777 | 38.594 |
| 1.3333333333333333 | 38.68 |
| 1.0666666666666667 | 38.752 |
| 0.8888888888888888 | 38.757 |
| 2.6666666666666665 | 38.491 |
| 1.7777777777777777 | 38.582 |
| 1.3333333333333333 | 38.703 |
| 1.0666666666666667 | 38.745 |
| 0.8888888888888888 | 38.793 |
| 2.6666666666666665 | 38.483 |
| 1.7777777777777777 | 38.576 |
| 1.3333333333333333 | 38.685 |
| 1.0666666666666667 | 38.759 |
| 0.8888888888888888 | 38.789 |
| 2.6666666666666665 | 38.449 |
| 1.7777777777777777 | 38.572 |
| 1.3333333333333333 | 38.678 |
| 1.0666666666666667 | 38.759 |
| 0.8888888888888888 | 38.794 |
| 2.6666666666666665 | 38.441 |
| 1.7777777777777777 | 38.568 |
| 1.3333333333333333 | 38.666 |
| 1.0666666666666667 | 38.739 |
| 0.8888888888888888 | 38.795 |
| 2.6666666666666665 | 38.464 |
| 1.7777777777777777 | 38.553 |
| 1.3333333333333333 | 38.668 |
| 1.0666666666666667 | 38.739 |
| 0.8888888888888888 | 38.785 |
| 3.3333333333333335 | 38.496 |
| 2.2222222222222223 | 38.537 |
| 1.6666666666666667 | 38.564 |
| 1.3333333333333333 | 38.562 |
| 1.1111111111111112 | 38.574 |
| 3.3333333333333335 | 38.467 |
| 2.2222222222222223 | 38.57 |
| 1.6666666666666667 | 38.61 |
| 1.3333333333333333 | 38.636 |
| 1.1111111111111112 | 38.667 |
| 3.3333333333333335 | 38.44 |
| 2.2222222222222223 | 38.559 |
| 1.6666666666666667 | 38.604 |
| 1.3333333333333333 | 38.676 |
| 1.1111111111111112 | 38.698 |
| 3.3333333333333335 | 38.415 |
| 2.2222222222222223 | 38.539 |
| 1.6666666666666667 | 38.619 |
| 1.3333333333333333 | 38.664 |
| 1.1111111111111112 | 38.732 |
| 3.3333333333333335 | 38.403 |
| 2.2222222222222223 | 38.53 |
| 1.6666666666666667 | 38.598 |
| 1.3333333333333333 | 38.676 |
| 1.1111111111111112 | 38.725 |
| 3.3333333333333335 | 38.369 |
| 2.2222222222222223 | 38.523 |
| 1.6666666666666667 | 38.587 |
| 1.3333333333333333 | 38.673 |
| 1.1111111111111112 | 38.729 |
| 3.3333333333333335 | 38.359 |
| 2.2222222222222223 | 38.517 |
| 1.6666666666666667 | 38.574 |
| 1.3333333333333333 | 38.65 |
| 1.1111111111111112 | 38.728 |
| 3.3333333333333335 | 38.38 |
| 2.2222222222222223 | 38.498 |
| 1.6666666666666667 | 38.573 |
| 1.3333333333333333 | 38.648 |
| 1.1111111111111112 | 38.716 |
| 4.0 | 38.5 |
| 2.6666666666666665 | 38.513 |
| 2.0 | 38.545 |
| 1.6 | 38.526 |
| 1.3333333333333333 | 38.534 |
| 4.0 | 38.467 |
| 2.6666666666666665 | 38.536 |
| 2.0 | 38.578 |
| 1.6 | 38.587 |
| 1.3333333333333333 | 38.615 |
| 4.0 | 38.433 |
| 2.6666666666666665 | 38.514 |
| 2.0 | 38.56 |
| 1.6 | 38.619 |
| 1.3333333333333333 | 38.641 |
| 4.0 | 38.401 |
| 2.6666666666666665 | 38.488 |
| 2.0 | 38.571 |
| 1.6 | 38.603 |
| 1.3333333333333333 | 38.671 |
| 4.0 | 38.374 |
| 2.6666666666666665 | 38.474 |
| 2.0 | 38.547 |
| 1.6 | 38.613 |
| 1.3333333333333333 | 38.662 |
| 4.0 | 38.336 |
| 2.6666666666666665 | 38.464 |
| 2.0 | 38.535 |
| 1.6 | 38.608 |
| 1.3333333333333333 | 38.663 |
| 4.0 | 38.325 |
| 2.6666666666666665 | 38.456 |
| 2.0 | 38.52 |
| 1.6 | 38.583 |
| 1.3333333333333333 | 38.661 |
| 4.0 | 38.345 |
| 2.6666666666666665 | 38.435 |
| 2.0 | 38.515 |
| 1.6 | 38.576 |
| 1.3333333333333333 | 38.648 |
| 4.666666666666667 | 38.493 |
| 3.111111111111111 | 38.491 |
| 2.3333333333333335 | 38.539 |
| 1.8666666666666667 | 38.506 |
| 1.5555555555555556 | 38.502 |
| 4.666666666666667 | 38.457 |
| 3.111111111111111 | 38.509 |
| 2.3333333333333335 | 38.565 |
| 1.8666666666666667 | 38.556 |
| 1.5555555555555556 | 38.575 |
| 4.666666666666667 | 38.419 |
| 3.111111111111111 | 38.481 |
| 2.3333333333333335 | 38.54 |
| 1.8666666666666667 | 38.578 |
| 1.5555555555555556 | 38.591 |
| 4.666666666666667 | 38.385 |
| 3.111111111111111 | 38.446 |
| 2.3333333333333335 | 38.544 |
| 1.8666666666666667 | 38.556 |
| 1.5555555555555556 | 38.618 |
| 4.666666666666667 | 38.354 |
| 3.111111111111111 | 38.428 |
| 2.3333333333333335 | 38.515 |
| 1.8666666666666667 | 38.564 |
| 1.5555555555555556 | 38.606 |
| 4.666666666666667 | 38.325 |
| 3.111111111111111 | 38.414 |
| 2.3333333333333335 | 38.501 |
| 1.8666666666666667 | 38.554 |
| 1.5555555555555556 | 38.601 |
| 4.666666666666667 | 38.314 |
| 3.111111111111111 | 38.404 |
| 2.3333333333333335 | 38.483 |
| 1.8666666666666667 | 38.527 |
| 1.5555555555555556 | 38.597 |
| 4.666666666666667 | 38.335 |
| 3.111111111111111 | 38.382 |
| 2.3333333333333335 | 38.477 |
| 1.8666666666666667 | 38.518 |
| 1.5555555555555556 | 38.579 |
| 5.333333333333333 | 38.489 |
| 3.5555555555555554 | 38.473 |
| 2.6666666666666665 | 38.516 |
| 2.1333333333333333 | 38.501 |
| 1.7777777777777777 | 38.474 |
| 5.333333333333333 | 38.452 |
| 3.5555555555555554 | 38.488 |
| 2.6666666666666665 | 38.539 |
| 2.1333333333333333 | 38.546 |
| 1.7777777777777777 | 38.537 |
| 5.333333333333333 | 38.416 |
| 3.5555555555555554 | 38.455 |
| 2.6666666666666665 | 38.509 |
| 2.1333333333333333 | 38.562 |
| 1.7777777777777777 | 38.549 |
| 5.333333333333333 | 38.381 |
| 3.5555555555555554 | 38.416 |
| 2.6666666666666665 | 38.508 |
| 2.1333333333333333 | 38.534 |
| 1.7777777777777777 | 38.569 |
| 5.333333333333333 | 38.348 |
| 3.5555555555555554 | 38.393 |
| 2.6666666666666665 | 38.476 |
| 2.1333333333333333 | 38.538 |
| 1.7777777777777777 | 38.554 |
| 5.333333333333333 | 38.318 |
| 3.5555555555555554 | 38.376 |
| 2.6666666666666665 | 38.457 |
| 2.1333333333333333 | 38.525 |
| 1.7777777777777777 | 38.547 |
| 5.333333333333333 | 38.302 |
| 3.5555555555555554 | 38.365 |
| 2.6666666666666665 | 38.441 |
| 2.1333333333333333 | 38.495 |
| 1.7777777777777777 | 38.544 |
| 5.333333333333333 | 38.323 |
| 3.5555555555555554 | 38.342 |
| 2.6666666666666665 | 38.433 |
| 2.1333333333333333 | 38.485 |
| 1.7777777777777777 | 38.524 |
| 6.0 | 38.509 |
| 4.0 | 38.476 |
| 3.0 | 38.506 |
| 2.4 | 38.493 |
| 2.0 | 38.471 |
| 6.0 | 38.473 |
| 4.0 | 38.49 |
| 3.0 | 38.524 |
| 2.4 | 38.537 |
| 2.0 | 38.532 |
| 6.0 | 38.434 |
| 4.0 | 38.456 |
| 3.0 | 38.492 |
| 2.4 | 38.55 |
| 2.0 | 38.537 |
| 6.0 | 38.397 |
| 4.0 | 38.413 |
| 3.0 | 38.487 |
| 2.4 | 38.518 |
| 2.0 | 38.553 |
| 6.0 | 38.362 |
| 4.0 | 38.387 |
| 3.0 | 38.446 |
| 2.4 | 38.514 |
| 2.0 | 38.533 |
| 6.0 | 38.332 |
| 4.0 | 38.367 |
| 3.0 | 38.424 |
| 2.4 | 38.498 |
| 2.0 | 38.522 |
| 6.0 | 38.315 |
| 4.0 | 38.355 |
| 3.0 | 38.404 |
| 2.4 | 38.468 |
| 2.0 | 38.517 |
| 6.0 | 38.32 |
| 4.0 | 38.33 |
| 3.0 | 38.397 |
| 2.4 | 38.456 |
| 2.0 | 38.495 |